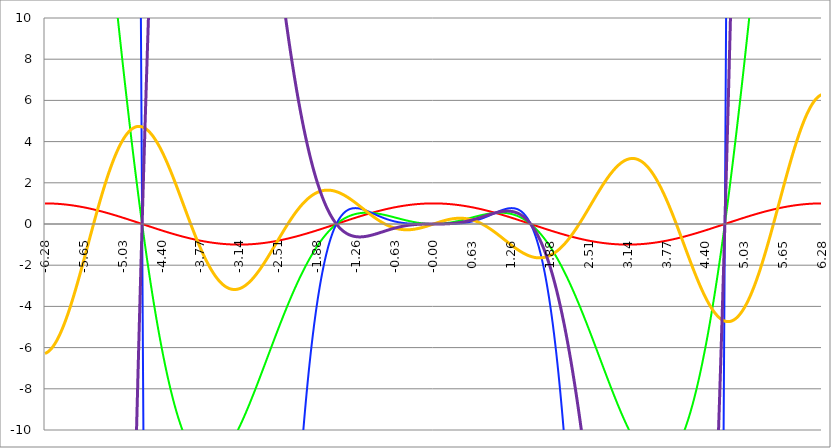
| Category | Series 1 | Series 0 | Series 2 | Series 3 | Series 4 |
|---|---|---|---|---|---|
| -6.283185307179586 | 1 | 39.478 | 1558.545 | -6.283 | -248.05 |
| -6.276902121872407 | 1 | 39.399 | 1552.29 | -6.276 | -247.302 |
| -6.270618936565228 | 1 | 39.318 | 1545.992 | -6.269 | -246.545 |
| -6.264335751258049 | 1 | 39.235 | 1539.653 | -6.26 | -245.781 |
| -6.25805256595087 | 1 | 39.151 | 1533.274 | -6.25 | -245.008 |
| -6.25176938064369 | 1 | 39.065 | 1526.854 | -6.239 | -244.227 |
| -6.245486195336511 | 0.999 | 38.978 | 1520.395 | -6.228 | -243.439 |
| -6.23920301002933 | 0.999 | 38.89 | 1513.897 | -6.215 | -242.643 |
| -6.232919824722153 | 0.999 | 38.8 | 1507.361 | -6.201 | -241.839 |
| -6.226636639414973 | 0.998 | 38.709 | 1500.788 | -6.187 | -241.027 |
| -6.220353454107794 | 0.998 | 38.616 | 1494.178 | -6.171 | -240.208 |
| -6.214070268800615 | 0.998 | 38.522 | 1487.533 | -6.155 | -239.381 |
| -6.207787083493435 | 0.997 | 38.427 | 1480.852 | -6.137 | -238.547 |
| -6.201503898186257 | 0.997 | 38.33 | 1474.136 | -6.119 | -237.706 |
| -6.195220712879077 | 0.996 | 38.232 | 1467.387 | -6.1 | -236.858 |
| -6.188937527571898 | 0.996 | 38.133 | 1460.605 | -6.079 | -236.002 |
| -6.182654342264719 | 0.995 | 38.032 | 1453.79 | -6.058 | -235.14 |
| -6.17637115695754 | 0.994 | 37.93 | 1446.943 | -6.036 | -234.271 |
| -6.170087971650361 | 0.994 | 37.827 | 1440.065 | -6.013 | -233.394 |
| -6.163804786343182 | 0.993 | 37.722 | 1433.156 | -5.989 | -232.512 |
| -6.157521601036002 | 0.992 | 37.616 | 1426.217 | -5.964 | -231.622 |
| -6.151238415728823 | 0.991 | 37.509 | 1419.249 | -5.938 | -230.726 |
| -6.144955230421644 | 0.99 | 37.4 | 1412.253 | -5.912 | -229.823 |
| -6.138672045114464 | 0.99 | 37.29 | 1405.228 | -5.884 | -228.914 |
| -6.132388859807286 | 0.989 | 37.179 | 1398.177 | -5.856 | -227.999 |
| -6.126105674500106 | 0.988 | 37.067 | 1391.098 | -5.826 | -227.077 |
| -6.119822489192927 | 0.987 | 36.954 | 1383.994 | -5.796 | -226.149 |
| -6.113539303885748 | 0.986 | 36.839 | 1376.864 | -5.765 | -225.216 |
| -6.107256118578569 | 0.985 | 36.723 | 1369.71 | -5.733 | -224.276 |
| -6.10097293327139 | 0.983 | 36.606 | 1362.532 | -5.7 | -223.33 |
| -6.09468974796421 | 0.982 | 36.487 | 1355.33 | -5.667 | -222.379 |
| -6.088406562657031 | 0.981 | 36.368 | 1348.105 | -5.632 | -221.422 |
| -6.082123377349852 | 0.98 | 36.247 | 1340.858 | -5.597 | -220.459 |
| -6.075840192042672 | 0.979 | 36.125 | 1333.589 | -5.561 | -219.491 |
| -6.069557006735494 | 0.977 | 36.002 | 1326.3 | -5.524 | -218.517 |
| -6.063273821428314 | 0.976 | 35.878 | 1318.99 | -5.486 | -217.538 |
| -6.056990636121135 | 0.975 | 35.753 | 1311.66 | -5.448 | -216.553 |
| -6.050707450813956 | 0.973 | 35.626 | 1304.312 | -5.408 | -215.564 |
| -6.044424265506777 | 0.972 | 35.499 | 1296.945 | -5.368 | -214.569 |
| -6.038141080199597 | 0.97 | 35.37 | 1289.56 | -5.327 | -213.569 |
| -6.031857894892418 | 0.969 | 35.24 | 1282.157 | -5.286 | -212.564 |
| -6.025574709585239 | 0.967 | 35.109 | 1274.738 | -5.243 | -211.555 |
| -6.01929152427806 | 0.965 | 34.978 | 1267.303 | -5.2 | -210.54 |
| -6.013008338970881 | 0.964 | 34.845 | 1259.853 | -5.156 | -209.521 |
| -6.006725153663701 | 0.962 | 34.711 | 1252.387 | -5.112 | -208.497 |
| -6.000441968356522 | 0.96 | 34.576 | 1244.907 | -5.066 | -207.469 |
| -5.994158783049343 | 0.959 | 34.44 | 1237.414 | -5.02 | -206.437 |
| -5.987875597742164 | 0.957 | 34.303 | 1229.907 | -4.974 | -205.4 |
| -5.981592412434984 | 0.955 | 34.165 | 1222.388 | -4.926 | -204.358 |
| -5.975309227127805 | 0.953 | 34.025 | 1214.857 | -4.878 | -203.313 |
| -5.969026041820626 | 0.951 | 33.885 | 1207.314 | -4.829 | -202.263 |
| -5.962742856513447 | 0.949 | 33.744 | 1199.76 | -4.78 | -201.209 |
| -5.956459671206268 | 0.947 | 33.602 | 1192.197 | -4.729 | -200.152 |
| -5.950176485899088 | 0.945 | 33.46 | 1184.623 | -4.679 | -199.09 |
| -5.94389330059191 | 0.943 | 33.316 | 1177.04 | -4.627 | -198.025 |
| -5.93761011528473 | 0.941 | 33.171 | 1169.449 | -4.575 | -196.956 |
| -5.931326929977551 | 0.939 | 33.025 | 1161.85 | -4.522 | -195.884 |
| -5.925043744670372 | 0.937 | 32.879 | 1154.243 | -4.469 | -194.807 |
| -5.918760559363193 | 0.934 | 32.731 | 1146.629 | -4.415 | -193.728 |
| -5.912477374056014 | 0.932 | 32.583 | 1139.009 | -4.361 | -192.645 |
| -5.906194188748834 | 0.93 | 32.434 | 1131.382 | -4.305 | -191.559 |
| -5.899911003441655 | 0.927 | 32.283 | 1123.751 | -4.25 | -190.469 |
| -5.893627818134476 | 0.925 | 32.132 | 1116.115 | -4.194 | -189.377 |
| -5.887344632827297 | 0.923 | 31.981 | 1108.474 | -4.137 | -188.281 |
| -5.881061447520117 | 0.92 | 31.828 | 1100.83 | -4.079 | -187.182 |
| -5.874778262212938 | 0.918 | 31.674 | 1093.182 | -4.022 | -186.081 |
| -5.868495076905759 | 0.915 | 31.52 | 1085.532 | -3.963 | -184.976 |
| -5.86221189159858 | 0.913 | 31.365 | 1077.879 | -3.904 | -183.869 |
| -5.855928706291401 | 0.91 | 31.209 | 1070.225 | -3.845 | -182.759 |
| -5.849645520984221 | 0.907 | 31.053 | 1062.57 | -3.785 | -181.647 |
| -5.843362335677042 | 0.905 | 30.895 | 1054.913 | -3.725 | -180.532 |
| -5.837079150369863 | 0.902 | 30.737 | 1047.257 | -3.664 | -179.415 |
| -5.830795965062684 | 0.899 | 30.578 | 1039.601 | -3.603 | -178.295 |
| -5.824512779755505 | 0.897 | 30.419 | 1031.946 | -3.541 | -177.173 |
| -5.818229594448325 | 0.894 | 30.258 | 1024.292 | -3.479 | -176.049 |
| -5.811946409141146 | 0.891 | 30.097 | 1016.64 | -3.416 | -174.923 |
| -5.805663223833967 | 0.888 | 29.935 | 1008.99 | -3.353 | -173.794 |
| -5.799380038526788 | 0.885 | 29.773 | 1001.343 | -3.29 | -172.664 |
| -5.793096853219609 | 0.882 | 29.61 | 993.7 | -3.226 | -171.532 |
| -5.78681366791243 | 0.879 | 29.446 | 986.06 | -3.162 | -170.398 |
| -5.780530482605251 | 0.876 | 29.281 | 978.424 | -3.097 | -169.262 |
| -5.774247297298071 | 0.873 | 29.116 | 970.792 | -3.032 | -168.124 |
| -5.767964111990892 | 0.87 | 28.951 | 963.166 | -2.967 | -166.985 |
| -5.761680926683713 | 0.867 | 28.784 | 955.545 | -2.902 | -165.845 |
| -5.755397741376534 | 0.864 | 28.617 | 947.931 | -2.836 | -164.703 |
| -5.749114556069355 | 0.861 | 28.45 | 940.323 | -2.77 | -163.56 |
| -5.742831370762175 | 0.858 | 28.281 | 932.721 | -2.703 | -162.415 |
| -5.736548185454996 | 0.854 | 28.113 | 925.127 | -2.636 | -161.269 |
| -5.730265000147816 | 0.851 | 27.943 | 917.541 | -2.569 | -160.122 |
| -5.723981814840638 | 0.848 | 27.773 | 909.963 | -2.502 | -158.974 |
| -5.717698629533459 | 0.844 | 27.603 | 902.394 | -2.434 | -157.825 |
| -5.711415444226279 | 0.841 | 27.432 | 894.834 | -2.367 | -156.675 |
| -5.7051322589191 | 0.838 | 27.26 | 887.283 | -2.299 | -155.524 |
| -5.698849073611921 | 0.834 | 27.088 | 879.742 | -2.23 | -154.372 |
| -5.692565888304742 | 0.831 | 26.916 | 872.212 | -2.162 | -153.219 |
| -5.686282702997562 | 0.827 | 26.743 | 864.692 | -2.093 | -152.066 |
| -5.679999517690383 | 0.824 | 26.569 | 857.184 | -2.024 | -150.913 |
| -5.673716332383204 | 0.82 | 26.395 | 849.687 | -1.955 | -149.758 |
| -5.667433147076025 | 0.816 | 26.221 | 842.202 | -1.886 | -148.604 |
| -5.661149961768846 | 0.813 | 26.046 | 834.73 | -1.817 | -147.449 |
| -5.654866776461667 | 0.809 | 25.87 | 827.27 | -1.747 | -146.293 |
| -5.648583591154487 | 0.805 | 25.695 | 819.823 | -1.678 | -145.138 |
| -5.642300405847308 | 0.802 | 25.518 | 812.39 | -1.608 | -143.982 |
| -5.63601722054013 | 0.798 | 25.342 | 804.971 | -1.538 | -142.826 |
| -5.62973403523295 | 0.794 | 25.165 | 797.566 | -1.468 | -141.67 |
| -5.623450849925771 | 0.79 | 24.987 | 790.176 | -1.398 | -140.514 |
| -5.617167664618591 | 0.786 | 24.809 | 782.801 | -1.328 | -139.359 |
| -5.610884479311412 | 0.782 | 24.631 | 775.442 | -1.258 | -138.203 |
| -5.604601294004233 | 0.778 | 24.453 | 768.098 | -1.188 | -137.048 |
| -5.598318108697054 | 0.775 | 24.274 | 760.77 | -1.118 | -135.893 |
| -5.592034923389875 | 0.771 | 24.095 | 753.459 | -1.048 | -134.738 |
| -5.585751738082695 | 0.766 | 23.915 | 746.165 | -0.978 | -133.584 |
| -5.579468552775516 | 0.762 | 23.735 | 738.888 | -0.907 | -132.43 |
| -5.573185367468337 | 0.758 | 23.555 | 731.628 | -0.837 | -131.276 |
| -5.566902182161157 | 0.754 | 23.375 | 724.387 | -0.767 | -130.124 |
| -5.560618996853979 | 0.75 | 23.194 | 717.163 | -0.697 | -128.972 |
| -5.5543358115468 | 0.746 | 23.013 | 709.959 | -0.627 | -127.821 |
| -5.54805262623962 | 0.742 | 22.831 | 702.773 | -0.557 | -126.67 |
| -5.54176944093244 | 0.738 | 22.65 | 695.606 | -0.487 | -125.521 |
| -5.535486255625262 | 0.733 | 22.468 | 688.459 | -0.417 | -124.372 |
| -5.529203070318083 | 0.729 | 22.286 | 681.332 | -0.347 | -123.224 |
| -5.522919885010904 | 0.725 | 22.104 | 674.225 | -0.277 | -122.078 |
| -5.516636699703724 | 0.72 | 21.921 | 667.139 | -0.208 | -120.932 |
| -5.510353514396545 | 0.716 | 21.739 | 660.074 | -0.138 | -119.788 |
| -5.504070329089366 | 0.712 | 21.556 | 653.029 | -0.069 | -118.645 |
| -5.497787143782186 | 0.707 | 21.373 | 646.006 | 0 | -117.503 |
| -5.491503958475008 | 0.703 | 21.19 | 639.005 | 0.069 | -116.362 |
| -5.485220773167828 | 0.698 | 21.006 | 632.026 | 0.138 | -115.223 |
| -5.47893758786065 | 0.694 | 20.823 | 625.069 | 0.207 | -114.086 |
| -5.47265440255347 | 0.689 | 20.639 | 618.135 | 0.275 | -112.95 |
| -5.466371217246291 | 0.685 | 20.455 | 611.223 | 0.343 | -111.815 |
| -5.460088031939112 | 0.68 | 20.271 | 604.335 | 0.411 | -110.682 |
| -5.453804846631932 | 0.675 | 20.087 | 597.47 | 0.479 | -109.551 |
| -5.447521661324753 | 0.671 | 19.903 | 590.629 | 0.547 | -108.422 |
| -5.441238476017574 | 0.666 | 19.719 | 583.812 | 0.614 | -107.294 |
| -5.434955290710395 | 0.661 | 19.534 | 577.019 | 0.681 | -106.168 |
| -5.428672105403215 | 0.657 | 19.35 | 570.251 | 0.748 | -105.044 |
| -5.422388920096036 | 0.652 | 19.165 | 563.507 | 0.815 | -103.922 |
| -5.416105734788857 | 0.647 | 18.981 | 556.789 | 0.881 | -102.802 |
| -5.409822549481678 | 0.642 | 18.796 | 550.095 | 0.947 | -101.685 |
| -5.403539364174499 | 0.637 | 18.612 | 543.428 | 1.013 | -100.569 |
| -5.39725617886732 | 0.633 | 18.427 | 536.786 | 1.078 | -99.455 |
| -5.39097299356014 | 0.628 | 18.242 | 530.17 | 1.143 | -98.344 |
| -5.384689808252961 | 0.623 | 18.058 | 523.58 | 1.208 | -97.235 |
| -5.378406622945782 | 0.618 | 17.873 | 517.016 | 1.272 | -96.128 |
| -5.372123437638603 | 0.613 | 17.688 | 510.48 | 1.336 | -95.024 |
| -5.365840252331424 | 0.608 | 17.504 | 503.97 | 1.4 | -93.922 |
| -5.359557067024244 | 0.603 | 17.319 | 497.487 | 1.463 | -92.823 |
| -5.353273881717065 | 0.598 | 17.134 | 491.032 | 1.526 | -91.726 |
| -5.346990696409886 | 0.593 | 16.95 | 484.605 | 1.588 | -90.631 |
| -5.340707511102707 | 0.588 | 16.765 | 478.205 | 1.65 | -89.54 |
| -5.334424325795528 | 0.583 | 16.581 | 471.833 | 1.712 | -88.451 |
| -5.328141140488348 | 0.578 | 16.397 | 465.489 | 1.773 | -87.364 |
| -5.32185795518117 | 0.572 | 16.213 | 459.174 | 1.834 | -86.281 |
| -5.31557476987399 | 0.567 | 16.028 | 452.887 | 1.895 | -85.2 |
| -5.30929158456681 | 0.562 | 15.844 | 446.629 | 1.954 | -84.122 |
| -5.303008399259631 | 0.557 | 15.66 | 440.4 | 2.014 | -83.047 |
| -5.296725213952453 | 0.552 | 15.477 | 434.2 | 2.073 | -81.975 |
| -5.290442028645273 | 0.546 | 15.293 | 428.03 | 2.132 | -80.906 |
| -5.284158843338094 | 0.541 | 15.109 | 421.889 | 2.19 | -79.84 |
| -5.277875658030915 | 0.536 | 14.926 | 415.778 | 2.247 | -78.777 |
| -5.271592472723735 | 0.531 | 14.743 | 409.696 | 2.304 | -77.718 |
| -5.265309287416557 | 0.525 | 14.56 | 403.645 | 2.361 | -76.661 |
| -5.259026102109377 | 0.52 | 14.377 | 397.624 | 2.417 | -75.608 |
| -5.252742916802198 | 0.514 | 14.194 | 391.633 | 2.472 | -74.558 |
| -5.246459731495019 | 0.509 | 14.012 | 385.672 | 2.528 | -73.511 |
| -5.24017654618784 | 0.504 | 13.829 | 379.743 | 2.582 | -72.468 |
| -5.23389336088066 | 0.498 | 13.647 | 373.844 | 2.636 | -71.427 |
| -5.227610175573481 | 0.493 | 13.465 | 367.976 | 2.689 | -70.391 |
| -5.221326990266302 | 0.487 | 13.284 | 362.139 | 2.742 | -69.358 |
| -5.215043804959122 | 0.482 | 13.102 | 356.334 | 2.794 | -68.328 |
| -5.208760619651944 | 0.476 | 12.921 | 350.56 | 2.846 | -67.302 |
| -5.202477434344764 | 0.471 | 12.74 | 344.817 | 2.897 | -66.279 |
| -5.196194249037585 | 0.465 | 12.559 | 339.106 | 2.948 | -65.26 |
| -5.189911063730406 | 0.46 | 12.379 | 333.427 | 2.998 | -64.245 |
| -5.183627878423227 | 0.454 | 12.199 | 327.78 | 3.047 | -63.234 |
| -5.177344693116048 | 0.448 | 12.019 | 322.164 | 3.096 | -62.226 |
| -5.171061507808868 | 0.443 | 11.839 | 316.581 | 3.144 | -61.222 |
| -5.164778322501689 | 0.437 | 11.66 | 311.031 | 3.191 | -60.221 |
| -5.15849513719451 | 0.431 | 11.481 | 305.512 | 3.238 | -59.225 |
| -5.152211951887331 | 0.426 | 11.302 | 300.026 | 3.284 | -58.233 |
| -5.145928766580152 | 0.42 | 11.124 | 294.573 | 3.33 | -57.244 |
| -5.139645581272972 | 0.414 | 10.946 | 289.152 | 3.375 | -56.259 |
| -5.133362395965793 | 0.409 | 10.768 | 283.765 | 3.419 | -55.279 |
| -5.127079210658614 | 0.403 | 10.591 | 278.41 | 3.462 | -54.302 |
| -5.120796025351435 | 0.397 | 10.414 | 273.088 | 3.505 | -53.329 |
| -5.114512840044256 | 0.391 | 10.238 | 267.799 | 3.548 | -52.361 |
| -5.108229654737076 | 0.386 | 10.061 | 262.543 | 3.589 | -51.396 |
| -5.101946469429897 | 0.38 | 9.886 | 257.321 | 3.63 | -50.436 |
| -5.095663284122718 | 0.374 | 9.71 | 252.132 | 3.67 | -49.48 |
| -5.08938009881554 | 0.368 | 9.535 | 246.976 | 3.71 | -48.528 |
| -5.08309691350836 | 0.362 | 9.36 | 241.853 | 3.749 | -47.58 |
| -5.07681372820118 | 0.356 | 9.186 | 236.765 | 3.787 | -46.636 |
| -5.070530542894002 | 0.351 | 9.012 | 231.71 | 3.824 | -45.697 |
| -5.064247357586822 | 0.345 | 8.839 | 226.688 | 3.861 | -44.762 |
| -5.057964172279643 | 0.339 | 8.666 | 221.701 | 3.897 | -43.832 |
| -5.051680986972464 | 0.333 | 8.493 | 216.747 | 3.933 | -42.906 |
| -5.045397801665285 | 0.327 | 8.321 | 211.827 | 3.967 | -41.984 |
| -5.039114616358106 | 0.321 | 8.15 | 206.941 | 4.001 | -41.067 |
| -5.032831431050926 | 0.315 | 7.978 | 202.088 | 4.034 | -40.154 |
| -5.026548245743747 | 0.309 | 7.808 | 197.27 | 4.067 | -39.246 |
| -5.020265060436568 | 0.303 | 7.637 | 192.486 | 4.098 | -38.342 |
| -5.013981875129389 | 0.297 | 7.468 | 187.736 | 4.129 | -37.443 |
| -5.00769868982221 | 0.291 | 7.298 | 183.02 | 4.159 | -36.548 |
| -5.00141550451503 | 0.285 | 7.13 | 178.339 | 4.189 | -35.658 |
| -4.995132319207851 | 0.279 | 6.961 | 173.691 | 4.218 | -34.772 |
| -4.98884913390067 | 0.273 | 6.793 | 169.078 | 4.245 | -33.891 |
| -4.982565948593493 | 0.267 | 6.626 | 164.499 | 4.273 | -33.015 |
| -4.976282763286313 | 0.261 | 6.459 | 159.955 | 4.299 | -32.143 |
| -4.969999577979134 | 0.255 | 6.293 | 155.444 | 4.325 | -31.277 |
| -4.963716392671955 | 0.249 | 6.127 | 150.968 | 4.35 | -30.414 |
| -4.957433207364776 | 0.243 | 5.962 | 146.527 | 4.374 | -29.557 |
| -4.951150022057597 | 0.236 | 5.798 | 142.119 | 4.397 | -28.704 |
| -4.944866836750418 | 0.23 | 5.633 | 137.747 | 4.42 | -27.856 |
| -4.938583651443238 | 0.224 | 5.47 | 133.408 | 4.442 | -27.013 |
| -4.932300466136059 | 0.218 | 5.307 | 129.104 | 4.463 | -26.175 |
| -4.92601728082888 | 0.212 | 5.144 | 124.834 | 4.483 | -25.342 |
| -4.9197340955217 | 0.206 | 4.983 | 120.599 | 4.503 | -24.513 |
| -4.913450910214521 | 0.2 | 4.821 | 116.398 | 4.522 | -23.69 |
| -4.907167724907342 | 0.194 | 4.661 | 112.232 | 4.54 | -22.871 |
| -4.900884539600163 | 0.187 | 4.501 | 108.1 | 4.557 | -22.057 |
| -4.894601354292984 | 0.181 | 4.341 | 104.002 | 4.573 | -21.248 |
| -4.888318168985805 | 0.175 | 4.182 | 99.939 | 4.589 | -20.444 |
| -4.882034983678625 | 0.169 | 4.024 | 95.91 | 4.604 | -19.645 |
| -4.875751798371446 | 0.163 | 3.866 | 91.915 | 4.618 | -18.851 |
| -4.869468613064267 | 0.156 | 3.709 | 87.955 | 4.631 | -18.062 |
| -4.863185427757088 | 0.15 | 3.553 | 84.029 | 4.644 | -17.279 |
| -4.856902242449909 | 0.144 | 3.397 | 80.137 | 4.655 | -16.5 |
| -4.85061905714273 | 0.138 | 3.242 | 76.279 | 4.666 | -15.726 |
| -4.84433587183555 | 0.132 | 3.087 | 72.456 | 4.677 | -14.957 |
| -4.838052686528371 | 0.125 | 2.934 | 68.667 | 4.686 | -14.193 |
| -4.831769501221192 | 0.119 | 2.78 | 64.912 | 4.695 | -13.434 |
| -4.825486315914013 | 0.113 | 2.628 | 61.191 | 4.703 | -12.681 |
| -4.819203130606833 | 0.107 | 2.476 | 57.505 | 4.71 | -11.932 |
| -4.812919945299654 | 0.1 | 2.325 | 53.852 | 4.716 | -11.189 |
| -4.806636759992475 | 0.094 | 2.174 | 50.233 | 4.721 | -10.451 |
| -4.800353574685296 | 0.088 | 2.024 | 46.649 | 4.726 | -9.718 |
| -4.794070389378117 | 0.082 | 1.875 | 43.098 | 4.73 | -8.99 |
| -4.787787204070938 | 0.075 | 1.727 | 39.581 | 4.733 | -8.267 |
| -4.781504018763758 | 0.069 | 1.579 | 36.098 | 4.736 | -7.55 |
| -4.77522083345658 | 0.063 | 1.432 | 32.649 | 4.738 | -6.837 |
| -4.7689376481494 | 0.057 | 1.285 | 29.233 | 4.738 | -6.13 |
| -4.762654462842221 | 0.05 | 1.14 | 25.851 | 4.739 | -5.428 |
| -4.756371277535042 | 0.044 | 0.995 | 22.503 | 4.738 | -4.731 |
| -4.750088092227862 | 0.038 | 0.85 | 19.188 | 4.737 | -4.04 |
| -4.743804906920683 | 0.031 | 0.707 | 15.907 | 4.734 | -3.353 |
| -4.737521721613504 | 0.025 | 0.564 | 12.659 | 4.732 | -2.672 |
| -4.731238536306324 | 0.019 | 0.422 | 9.444 | 4.728 | -1.996 |
| -4.724955350999146 | 0.013 | 0.281 | 6.263 | 4.723 | -1.326 |
| -4.718672165691966 | 0.006 | 0.14 | 3.115 | 4.718 | -0.66 |
| -4.712388980384787 | 0 | 0 | 0 | 4.712 | 0 |
| -4.706105795077608 | -0.006 | -0.139 | -3.082 | 4.706 | 0.655 |
| -4.699822609770429 | -0.013 | -0.278 | -6.131 | 4.698 | 1.304 |
| -4.69353942446325 | -0.019 | -0.415 | -9.147 | 4.69 | 1.949 |
| -4.68725623915607 | -0.025 | -0.552 | -12.13 | 4.681 | 2.588 |
| -4.680973053848891 | -0.031 | -0.688 | -15.081 | 4.672 | 3.222 |
| -4.674689868541712 | -0.038 | -0.824 | -17.999 | 4.661 | 3.85 |
| -4.668406683234533 | -0.044 | -0.958 | -20.884 | 4.65 | 4.473 |
| -4.662123497927354 | -0.05 | -1.092 | -23.737 | 4.639 | 5.091 |
| -4.655840312620174 | -0.057 | -1.225 | -26.557 | 4.626 | 5.704 |
| -4.649557127312995 | -0.063 | -1.357 | -29.345 | 4.613 | 6.311 |
| -4.643273942005816 | -0.069 | -1.489 | -32.101 | 4.599 | 6.914 |
| -4.636990756698637 | -0.075 | -1.62 | -34.825 | 4.584 | 7.51 |
| -4.630707571391458 | -0.082 | -1.75 | -37.517 | 4.569 | 8.102 |
| -4.624424386084279 | -0.088 | -1.879 | -40.177 | 4.553 | 8.688 |
| -4.618141200777099 | -0.094 | -2.007 | -42.805 | 4.536 | 9.269 |
| -4.61185801546992 | -0.1 | -2.135 | -45.402 | 4.519 | 9.845 |
| -4.605574830162741 | -0.107 | -2.261 | -47.966 | 4.501 | 10.415 |
| -4.599291644855561 | -0.113 | -2.387 | -50.5 | 4.482 | 10.98 |
| -4.593008459548383 | -0.119 | -2.512 | -53.002 | 4.463 | 11.54 |
| -4.586725274241203 | -0.125 | -2.637 | -55.472 | 4.443 | 12.094 |
| -4.580442088934024 | -0.132 | -2.76 | -57.912 | 4.422 | 12.643 |
| -4.574158903626845 | -0.138 | -2.883 | -60.32 | 4.4 | 13.187 |
| -4.567875718319666 | -0.144 | -3.005 | -62.698 | 4.378 | 13.726 |
| -4.561592533012487 | -0.15 | -3.126 | -65.044 | 4.356 | 14.259 |
| -4.555309347705307 | -0.156 | -3.246 | -67.36 | 4.332 | 14.787 |
| -4.549026162398128 | -0.163 | -3.366 | -69.646 | 4.308 | 15.31 |
| -4.542742977090949 | -0.169 | -3.484 | -71.9 | 4.284 | 15.828 |
| -4.53645979178377 | -0.175 | -3.602 | -74.125 | 4.259 | 16.34 |
| -4.530176606476591 | -0.181 | -3.719 | -76.319 | 4.233 | 16.847 |
| -4.523893421169412 | -0.187 | -3.835 | -78.483 | 4.206 | 17.349 |
| -4.517610235862232 | -0.194 | -3.95 | -80.617 | 4.179 | 17.845 |
| -4.511327050555053 | -0.2 | -4.065 | -82.721 | 4.151 | 18.336 |
| -4.505043865247874 | -0.206 | -4.178 | -84.796 | 4.123 | 18.822 |
| -4.498760679940694 | -0.212 | -4.291 | -86.84 | 4.094 | 19.303 |
| -4.492477494633515 | -0.218 | -4.403 | -88.856 | 4.065 | 19.779 |
| -4.486194309326336 | -0.224 | -4.514 | -90.842 | 4.035 | 20.249 |
| -4.479911124019157 | -0.23 | -4.624 | -92.798 | 4.004 | 20.714 |
| -4.473627938711977 | -0.236 | -4.733 | -94.726 | 3.973 | 21.174 |
| -4.467344753404799 | -0.243 | -4.842 | -96.625 | 3.941 | 21.629 |
| -4.46106156809762 | -0.249 | -4.949 | -98.494 | 3.909 | 22.079 |
| -4.45477838279044 | -0.255 | -5.056 | -100.335 | 3.876 | 22.523 |
| -4.44849519748326 | -0.261 | -5.162 | -102.148 | 3.843 | 22.962 |
| -4.442212012176082 | -0.267 | -5.267 | -103.932 | 3.809 | 23.396 |
| -4.435928826868903 | -0.273 | -5.371 | -105.688 | 3.775 | 23.825 |
| -4.429645641561723 | -0.279 | -5.474 | -107.415 | 3.74 | 24.249 |
| -4.423362456254544 | -0.285 | -5.577 | -109.115 | 3.705 | 24.668 |
| -4.417079270947365 | -0.291 | -5.678 | -110.787 | 3.669 | 25.081 |
| -4.410796085640185 | -0.297 | -5.779 | -112.431 | 3.632 | 25.49 |
| -4.404512900333007 | -0.303 | -5.879 | -114.047 | 3.596 | 25.893 |
| -4.398229715025827 | -0.309 | -5.978 | -115.636 | 3.558 | 26.292 |
| -4.391946529718648 | -0.315 | -6.076 | -117.198 | 3.52 | 26.685 |
| -4.38566334441147 | -0.321 | -6.173 | -118.733 | 3.482 | 27.073 |
| -4.37938015910429 | -0.327 | -6.269 | -120.24 | 3.443 | 27.456 |
| -4.373096973797111 | -0.333 | -6.365 | -121.721 | 3.404 | 27.834 |
| -4.366813788489932 | -0.339 | -6.459 | -123.175 | 3.365 | 28.207 |
| -4.360530603182752 | -0.345 | -6.553 | -124.602 | 3.325 | 28.575 |
| -4.354247417875573 | -0.351 | -6.646 | -126.004 | 3.284 | 28.938 |
| -4.347964232568394 | -0.356 | -6.738 | -127.378 | 3.243 | 29.296 |
| -4.341681047261215 | -0.362 | -6.829 | -128.727 | 3.202 | 29.649 |
| -4.335397861954035 | -0.368 | -6.919 | -130.05 | 3.16 | 29.997 |
| -4.329114676646856 | -0.374 | -7.008 | -131.347 | 3.118 | 30.34 |
| -4.322831491339677 | -0.38 | -7.097 | -132.619 | 3.076 | 30.679 |
| -4.316548306032498 | -0.386 | -7.184 | -133.864 | 3.033 | 31.012 |
| -4.310265120725319 | -0.391 | -7.271 | -135.085 | 2.99 | 31.34 |
| -4.30398193541814 | -0.397 | -7.357 | -136.281 | 2.946 | 31.664 |
| -4.29769875011096 | -0.403 | -7.442 | -137.451 | 2.902 | 31.982 |
| -4.291415564803781 | -0.409 | -7.526 | -138.597 | 2.858 | 32.296 |
| -4.285132379496602 | -0.414 | -7.609 | -139.718 | 2.814 | 32.605 |
| -4.278849194189422 | -0.42 | -7.691 | -140.814 | 2.769 | 32.909 |
| -4.272566008882244 | -0.426 | -7.773 | -141.886 | 2.723 | 33.209 |
| -4.266282823575064 | -0.431 | -7.853 | -142.934 | 2.678 | 33.503 |
| -4.259999638267885 | -0.437 | -7.933 | -143.958 | 2.632 | 33.793 |
| -4.253716452960706 | -0.443 | -8.011 | -144.958 | 2.586 | 34.078 |
| -4.247433267653527 | -0.448 | -8.089 | -145.934 | 2.54 | 34.358 |
| -4.241150082346347 | -0.454 | -8.166 | -146.886 | 2.493 | 34.634 |
| -4.234866897039168 | -0.46 | -8.242 | -147.816 | 2.446 | 34.904 |
| -4.228583711731989 | -0.465 | -8.317 | -148.722 | 2.399 | 35.171 |
| -4.22230052642481 | -0.471 | -8.392 | -149.604 | 2.351 | 35.432 |
| -4.216017341117631 | -0.476 | -8.465 | -150.464 | 2.304 | 35.689 |
| -4.209734155810452 | -0.482 | -8.538 | -151.302 | 2.256 | 35.941 |
| -4.203450970503273 | -0.487 | -8.609 | -152.116 | 2.208 | 36.188 |
| -4.197167785196093 | -0.493 | -8.68 | -152.909 | 2.159 | 36.431 |
| -4.190884599888914 | -0.498 | -8.75 | -153.679 | 2.111 | 36.67 |
| -4.184601414581734 | -0.504 | -8.819 | -154.427 | 2.062 | 36.904 |
| -4.178318229274556 | -0.509 | -8.887 | -155.153 | 2.013 | 37.133 |
| -4.172035043967377 | -0.514 | -8.954 | -155.857 | 1.964 | 37.358 |
| -4.165751858660197 | -0.52 | -9.021 | -156.54 | 1.914 | 37.578 |
| -4.159468673353018 | -0.525 | -9.086 | -157.201 | 1.865 | 37.794 |
| -4.153185488045839 | -0.531 | -9.151 | -157.841 | 1.815 | 38.005 |
| -4.14690230273866 | -0.536 | -9.215 | -158.46 | 1.766 | 38.212 |
| -4.140619117431481 | -0.541 | -9.277 | -159.058 | 1.716 | 38.414 |
| -4.134335932124301 | -0.546 | -9.339 | -159.635 | 1.666 | 38.612 |
| -4.128052746817122 | -0.552 | -9.4 | -160.192 | 1.616 | 38.806 |
| -4.121769561509943 | -0.557 | -9.461 | -160.729 | 1.565 | 38.995 |
| -4.115486376202764 | -0.562 | -9.52 | -161.245 | 1.515 | 39.18 |
| -4.109203190895584 | -0.567 | -9.579 | -161.741 | 1.465 | 39.361 |
| -4.102920005588405 | -0.572 | -9.636 | -162.217 | 1.414 | 39.537 |
| -4.096636820281226 | -0.578 | -9.693 | -162.673 | 1.363 | 39.709 |
| -4.090353634974047 | -0.583 | -9.749 | -163.11 | 1.313 | 39.877 |
| -4.084070449666868 | -0.588 | -9.804 | -163.528 | 1.262 | 40.04 |
| -4.077787264359689 | -0.593 | -9.858 | -163.926 | 1.211 | 40.2 |
| -4.071504079052509 | -0.598 | -9.912 | -164.305 | 1.16 | 40.355 |
| -4.06522089374533 | -0.603 | -9.964 | -164.666 | 1.11 | 40.506 |
| -4.058937708438151 | -0.608 | -10.016 | -165.007 | 1.059 | 40.653 |
| -4.052654523130972 | -0.613 | -10.066 | -165.33 | 1.008 | 40.796 |
| -4.046371337823793 | -0.618 | -10.116 | -165.635 | 0.957 | 40.934 |
| -4.040088152516613 | -0.623 | -10.165 | -165.922 | 0.906 | 41.069 |
| -4.033804967209434 | -0.628 | -10.214 | -166.19 | 0.855 | 41.199 |
| -4.027521781902255 | -0.633 | -10.261 | -166.441 | 0.804 | 41.326 |
| -4.021238596595076 | -0.637 | -10.307 | -166.674 | 0.754 | 41.448 |
| -4.014955411287897 | -0.642 | -10.353 | -166.889 | 0.703 | 41.567 |
| -4.008672225980717 | -0.647 | -10.398 | -167.088 | 0.652 | 41.682 |
| -4.002389040673538 | -0.652 | -10.442 | -167.268 | 0.601 | 41.792 |
| -3.996105855366359 | -0.657 | -10.485 | -167.432 | 0.551 | 41.899 |
| -3.989822670059179 | -0.661 | -10.527 | -167.579 | 0.5 | 42.002 |
| -3.983539484752 | -0.666 | -10.569 | -167.71 | 0.45 | 42.101 |
| -3.97725629944482 | -0.671 | -10.609 | -167.824 | 0.399 | 42.196 |
| -3.97097311413764 | -0.675 | -10.649 | -167.921 | 0.349 | 42.287 |
| -3.96468992883046 | -0.68 | -10.688 | -168.003 | 0.299 | 42.375 |
| -3.958406743523281 | -0.685 | -10.726 | -168.068 | 0.249 | 42.458 |
| -3.952123558216101 | -0.689 | -10.763 | -168.118 | 0.199 | 42.539 |
| -3.945840372908922 | -0.694 | -10.8 | -168.151 | 0.149 | 42.615 |
| -3.939557187601742 | -0.698 | -10.836 | -168.17 | 0.099 | 42.687 |
| -3.933274002294562 | -0.703 | -10.87 | -168.173 | 0.049 | 42.756 |
| -3.926990816987382 | -0.707 | -10.904 | -168.161 | 0 | 42.822 |
| -3.920707631680203 | -0.712 | -10.938 | -168.134 | -0.049 | 42.883 |
| -3.914424446373023 | -0.716 | -10.97 | -168.092 | -0.098 | 42.942 |
| -3.908141261065844 | -0.72 | -11.002 | -168.035 | -0.147 | 42.996 |
| -3.901858075758664 | -0.725 | -11.032 | -167.964 | -0.196 | 43.047 |
| -3.895574890451484 | -0.729 | -11.062 | -167.878 | -0.245 | 43.095 |
| -3.889291705144305 | -0.733 | -11.092 | -167.779 | -0.293 | 43.139 |
| -3.883008519837125 | -0.738 | -11.12 | -167.665 | -0.341 | 43.179 |
| -3.876725334529945 | -0.742 | -11.148 | -167.538 | -0.389 | 43.216 |
| -3.870442149222766 | -0.746 | -11.174 | -167.397 | -0.437 | 43.25 |
| -3.864158963915586 | -0.75 | -11.2 | -167.242 | -0.484 | 43.28 |
| -3.857875778608407 | -0.754 | -11.226 | -167.074 | -0.532 | 43.307 |
| -3.851592593301227 | -0.758 | -11.25 | -166.893 | -0.579 | 43.331 |
| -3.845309407994047 | -0.762 | -11.274 | -166.699 | -0.625 | 43.351 |
| -3.839026222686868 | -0.766 | -11.297 | -166.492 | -0.672 | 43.368 |
| -3.832743037379688 | -0.771 | -11.319 | -166.272 | -0.718 | 43.382 |
| -3.826459852072508 | -0.775 | -11.34 | -166.04 | -0.764 | 43.392 |
| -3.820176666765329 | -0.778 | -11.361 | -165.795 | -0.81 | 43.4 |
| -3.813893481458149 | -0.782 | -11.38 | -165.538 | -0.855 | 43.404 |
| -3.807610296150969 | -0.786 | -11.4 | -165.269 | -0.9 | 43.405 |
| -3.80132711084379 | -0.79 | -11.418 | -164.988 | -0.945 | 43.403 |
| -3.79504392553661 | -0.794 | -11.435 | -164.696 | -0.99 | 43.398 |
| -3.78876074022943 | -0.798 | -11.452 | -164.392 | -1.034 | 43.389 |
| -3.782477554922251 | -0.802 | -11.468 | -164.076 | -1.078 | 43.378 |
| -3.776194369615071 | -0.805 | -11.483 | -163.749 | -1.122 | 43.364 |
| -3.769911184307892 | -0.809 | -11.498 | -163.411 | -1.165 | 43.346 |
| -3.763627999000712 | -0.813 | -11.512 | -163.062 | -1.208 | 43.326 |
| -3.757344813693532 | -0.816 | -11.525 | -162.703 | -1.251 | 43.303 |
| -3.751061628386352 | -0.82 | -11.537 | -162.332 | -1.293 | 43.276 |
| -3.744778443079173 | -0.824 | -11.549 | -161.952 | -1.335 | 43.247 |
| -3.738495257771993 | -0.827 | -11.56 | -161.56 | -1.376 | 43.215 |
| -3.732212072464814 | -0.831 | -11.57 | -161.159 | -1.417 | 43.181 |
| -3.725928887157634 | -0.834 | -11.579 | -160.748 | -1.458 | 43.143 |
| -3.719645701850454 | -0.838 | -11.588 | -160.327 | -1.499 | 43.103 |
| -3.713362516543275 | -0.841 | -11.596 | -159.896 | -1.539 | 43.06 |
| -3.707079331236095 | -0.844 | -11.603 | -159.455 | -1.578 | 43.014 |
| -3.700796145928915 | -0.848 | -11.61 | -159.005 | -1.618 | 42.965 |
| -3.694512960621736 | -0.851 | -11.616 | -158.546 | -1.657 | 42.914 |
| -3.688229775314556 | -0.854 | -11.621 | -158.078 | -1.695 | 42.86 |
| -3.681946590007376 | -0.858 | -11.625 | -157.6 | -1.733 | 42.804 |
| -3.675663404700197 | -0.861 | -11.629 | -157.114 | -1.771 | 42.744 |
| -3.669380219393017 | -0.864 | -11.632 | -156.62 | -1.808 | 42.683 |
| -3.663097034085838 | -0.867 | -11.635 | -156.116 | -1.845 | 42.619 |
| -3.656813848778658 | -0.87 | -11.636 | -155.605 | -1.881 | 42.552 |
| -3.650530663471478 | -0.873 | -11.637 | -155.085 | -1.917 | 42.483 |
| -3.644247478164299 | -0.876 | -11.638 | -154.557 | -1.953 | 42.411 |
| -3.63796429285712 | -0.879 | -11.638 | -154.021 | -1.988 | 42.337 |
| -3.631681107549939 | -0.882 | -11.637 | -153.477 | -2.022 | 42.261 |
| -3.62539792224276 | -0.885 | -11.635 | -152.925 | -2.057 | 42.182 |
| -3.61911473693558 | -0.888 | -11.633 | -152.366 | -2.09 | 42.1 |
| -3.612831551628401 | -0.891 | -11.63 | -151.8 | -2.124 | 42.017 |
| -3.606548366321221 | -0.894 | -11.626 | -151.226 | -2.156 | 41.931 |
| -3.600265181014041 | -0.897 | -11.622 | -150.646 | -2.189 | 41.843 |
| -3.593981995706862 | -0.899 | -11.617 | -150.058 | -2.221 | 41.753 |
| -3.587698810399682 | -0.902 | -11.612 | -149.463 | -2.252 | 41.66 |
| -3.581415625092502 | -0.905 | -11.606 | -148.862 | -2.283 | 41.565 |
| -3.575132439785323 | -0.907 | -11.599 | -148.254 | -2.313 | 41.468 |
| -3.568849254478143 | -0.91 | -11.592 | -147.64 | -2.343 | 41.369 |
| -3.562566069170964 | -0.913 | -11.584 | -147.02 | -2.373 | 41.268 |
| -3.556282883863784 | -0.915 | -11.575 | -146.393 | -2.402 | 41.165 |
| -3.549999698556604 | -0.918 | -11.566 | -145.76 | -2.43 | 41.059 |
| -3.543716513249425 | -0.92 | -11.556 | -145.122 | -2.458 | 40.952 |
| -3.537433327942245 | -0.923 | -11.546 | -144.478 | -2.486 | 40.843 |
| -3.531150142635065 | -0.925 | -11.535 | -143.828 | -2.513 | 40.731 |
| -3.524866957327886 | -0.927 | -11.523 | -143.172 | -2.539 | 40.618 |
| -3.518583772020706 | -0.93 | -11.511 | -142.512 | -2.565 | 40.503 |
| -3.512300586713526 | -0.932 | -11.498 | -141.846 | -2.59 | 40.385 |
| -3.506017401406347 | -0.934 | -11.485 | -141.174 | -2.615 | 40.266 |
| -3.499734216099167 | -0.937 | -11.471 | -140.498 | -2.64 | 40.145 |
| -3.493451030791987 | -0.939 | -11.456 | -139.817 | -2.664 | 40.023 |
| -3.487167845484808 | -0.941 | -11.441 | -139.132 | -2.687 | 39.898 |
| -3.480884660177628 | -0.943 | -11.426 | -138.441 | -2.71 | 39.772 |
| -3.474601474870449 | -0.945 | -11.41 | -137.747 | -2.732 | 39.644 |
| -3.468318289563269 | -0.947 | -11.393 | -137.047 | -2.754 | 39.514 |
| -3.462035104256089 | -0.949 | -11.376 | -136.344 | -2.775 | 39.383 |
| -3.45575191894891 | -0.951 | -11.358 | -135.636 | -2.796 | 39.249 |
| -3.44946873364173 | -0.953 | -11.339 | -134.925 | -2.816 | 39.115 |
| -3.44318554833455 | -0.955 | -11.32 | -134.21 | -2.836 | 38.978 |
| -3.436902363027371 | -0.957 | -11.301 | -133.49 | -2.855 | 38.84 |
| -3.430619177720191 | -0.959 | -11.281 | -132.768 | -2.873 | 38.701 |
| -3.424335992413011 | -0.96 | -11.26 | -132.041 | -2.891 | 38.56 |
| -3.418052807105832 | -0.962 | -11.239 | -131.311 | -2.909 | 38.417 |
| -3.411769621798652 | -0.964 | -11.218 | -130.578 | -2.926 | 38.273 |
| -3.405486436491473 | -0.965 | -11.196 | -129.842 | -2.942 | 38.127 |
| -3.399203251184293 | -0.967 | -11.173 | -129.103 | -2.958 | 37.98 |
| -3.392920065877113 | -0.969 | -11.15 | -128.361 | -2.973 | 37.832 |
| -3.386636880569934 | -0.97 | -11.127 | -127.615 | -2.988 | 37.682 |
| -3.380353695262754 | -0.972 | -11.103 | -126.867 | -3.002 | 37.531 |
| -3.374070509955574 | -0.973 | -11.078 | -126.117 | -3.016 | 37.378 |
| -3.367787324648395 | -0.975 | -11.053 | -125.364 | -3.029 | 37.224 |
| -3.361504139341215 | -0.976 | -11.028 | -124.608 | -3.042 | 37.069 |
| -3.355220954034035 | -0.977 | -11.002 | -123.851 | -3.054 | 36.913 |
| -3.348937768726855 | -0.979 | -10.975 | -123.091 | -3.065 | 36.755 |
| -3.342654583419676 | -0.98 | -10.948 | -122.329 | -3.076 | 36.596 |
| -3.336371398112496 | -0.981 | -10.921 | -121.564 | -3.086 | 36.436 |
| -3.330088212805317 | -0.982 | -10.893 | -120.798 | -3.096 | 36.275 |
| -3.323805027498137 | -0.983 | -10.865 | -120.031 | -3.106 | 36.112 |
| -3.317521842190957 | -0.985 | -10.836 | -119.261 | -3.114 | 35.949 |
| -3.311238656883778 | -0.986 | -10.807 | -118.49 | -3.122 | 35.784 |
| -3.304955471576598 | -0.987 | -10.777 | -117.718 | -3.13 | 35.619 |
| -3.298672286269419 | -0.988 | -10.747 | -116.944 | -3.137 | 35.452 |
| -3.292389100962239 | -0.989 | -10.717 | -116.168 | -3.144 | 35.284 |
| -3.286105915655059 | -0.99 | -10.686 | -115.392 | -3.15 | 35.115 |
| -3.27982273034788 | -0.99 | -10.655 | -114.614 | -3.155 | 34.945 |
| -3.2735395450407 | -0.991 | -10.623 | -113.836 | -3.16 | 34.775 |
| -3.26725635973352 | -0.992 | -10.591 | -113.056 | -3.165 | 34.603 |
| -3.260973174426341 | -0.993 | -10.558 | -112.276 | -3.168 | 34.43 |
| -3.254689989119161 | -0.994 | -10.525 | -111.495 | -3.172 | 34.257 |
| -3.248406803811982 | -0.994 | -10.492 | -110.713 | -3.175 | 34.082 |
| -3.242123618504802 | -0.995 | -10.458 | -109.931 | -3.177 | 33.907 |
| -3.235840433197622 | -0.996 | -10.424 | -109.148 | -3.179 | 33.731 |
| -3.229557247890442 | -0.996 | -10.39 | -108.365 | -3.18 | 33.554 |
| -3.223274062583263 | -0.997 | -10.355 | -107.582 | -3.18 | 33.377 |
| -3.216990877276083 | -0.997 | -10.32 | -106.798 | -3.18 | 33.198 |
| -3.210707691968904 | -0.998 | -10.284 | -106.014 | -3.18 | 33.019 |
| -3.204424506661724 | -0.998 | -10.248 | -105.231 | -3.179 | 32.839 |
| -3.198141321354544 | -0.998 | -10.212 | -104.447 | -3.178 | 32.659 |
| -3.191858136047365 | -0.999 | -10.175 | -103.663 | -3.176 | 32.477 |
| -3.185574950740185 | -0.999 | -10.138 | -102.88 | -3.173 | 32.296 |
| -3.179291765433005 | -0.999 | -10.101 | -102.097 | -3.17 | 32.113 |
| -3.173008580125826 | -1 | -10.063 | -101.314 | -3.167 | 31.93 |
| -3.166725394818646 | -1 | -10.025 | -100.532 | -3.163 | 31.746 |
| -3.160442209511467 | -1 | -9.987 | -99.75 | -3.158 | 31.562 |
| -3.154159024204287 | -1 | -9.948 | -98.969 | -3.153 | 31.377 |
| -3.147875838897107 | -1 | -9.909 | -98.189 | -3.148 | 31.192 |
| -3.141592653589928 | -1 | -9.87 | -97.409 | -3.142 | 31.006 |
| -3.135309468282748 | -1 | -9.83 | -96.63 | -3.135 | 30.82 |
| -3.129026282975568 | -1 | -9.79 | -95.852 | -3.128 | 30.633 |
| -3.122743097668389 | -1 | -9.75 | -95.075 | -3.121 | 30.446 |
| -3.116459912361209 | -1 | -9.709 | -94.299 | -3.113 | 30.259 |
| -3.110176727054029 | -1 | -9.668 | -93.525 | -3.104 | 30.071 |
| -3.10389354174685 | -0.999 | -9.627 | -92.751 | -3.095 | 29.882 |
| -3.09761035643967 | -0.999 | -9.586 | -91.979 | -3.086 | 29.693 |
| -3.09132717113249 | -0.999 | -9.544 | -91.208 | -3.076 | 29.504 |
| -3.085043985825311 | -0.998 | -9.502 | -90.438 | -3.065 | 29.315 |
| -3.078760800518131 | -0.998 | -9.46 | -89.67 | -3.054 | 29.125 |
| -3.072477615210952 | -0.998 | -9.418 | -88.903 | -3.043 | 28.935 |
| -3.066194429903772 | -0.997 | -9.375 | -88.138 | -3.031 | 28.745 |
| -3.059911244596592 | -0.997 | -9.332 | -87.375 | -3.019 | 28.555 |
| -3.053628059289413 | -0.996 | -9.289 | -86.613 | -3.006 | 28.364 |
| -3.047344873982233 | -0.996 | -9.245 | -85.853 | -2.993 | 28.173 |
| -3.041061688675053 | -0.995 | -9.201 | -85.095 | -2.98 | 27.982 |
| -3.034778503367874 | -0.994 | -9.157 | -84.338 | -2.966 | 27.791 |
| -3.028495318060694 | -0.994 | -9.113 | -83.584 | -2.951 | 27.599 |
| -3.022212132753515 | -0.993 | -9.069 | -82.832 | -2.936 | 27.408 |
| -3.015928947446335 | -0.992 | -9.024 | -82.082 | -2.921 | 27.216 |
| -3.009645762139155 | -0.991 | -8.979 | -81.334 | -2.905 | 27.024 |
| -3.003362576831975 | -0.99 | -8.934 | -80.588 | -2.889 | 26.832 |
| -2.997079391524796 | -0.99 | -8.889 | -79.844 | -2.873 | 26.641 |
| -2.990796206217616 | -0.989 | -8.843 | -79.103 | -2.856 | 26.449 |
| -2.984513020910436 | -0.988 | -8.798 | -78.364 | -2.838 | 26.257 |
| -2.978229835603257 | -0.987 | -8.752 | -77.627 | -2.821 | 26.065 |
| -2.971946650296077 | -0.986 | -8.706 | -76.893 | -2.803 | 25.873 |
| -2.965663464988898 | -0.985 | -8.659 | -76.161 | -2.784 | 25.681 |
| -2.959380279681718 | -0.983 | -8.613 | -75.432 | -2.765 | 25.489 |
| -2.953097094374538 | -0.982 | -8.566 | -74.705 | -2.746 | 25.297 |
| -2.946813909067359 | -0.981 | -8.52 | -73.981 | -2.726 | 25.105 |
| -2.94053072376018 | -0.98 | -8.473 | -73.26 | -2.706 | 24.914 |
| -2.934247538453 | -0.979 | -8.425 | -72.541 | -2.686 | 24.722 |
| -2.92796435314582 | -0.977 | -8.378 | -71.825 | -2.665 | 24.531 |
| -2.92168116783864 | -0.976 | -8.331 | -71.112 | -2.644 | 24.339 |
| -2.915397982531461 | -0.975 | -8.283 | -70.402 | -2.622 | 24.148 |
| -2.909114797224281 | -0.973 | -8.235 | -69.695 | -2.6 | 23.957 |
| -2.902831611917101 | -0.972 | -8.187 | -68.99 | -2.578 | 23.767 |
| -2.896548426609922 | -0.97 | -8.139 | -68.289 | -2.556 | 23.576 |
| -2.890265241302742 | -0.969 | -8.091 | -67.591 | -2.533 | 23.386 |
| -2.883982055995562 | -0.967 | -8.043 | -66.896 | -2.51 | 23.196 |
| -2.877698870688383 | -0.965 | -7.994 | -66.203 | -2.486 | 23.006 |
| -2.871415685381203 | -0.964 | -7.946 | -65.514 | -2.462 | 22.816 |
| -2.865132500074023 | -0.962 | -7.897 | -64.829 | -2.438 | 22.627 |
| -2.858849314766844 | -0.96 | -7.848 | -64.146 | -2.414 | 22.438 |
| -2.852566129459664 | -0.959 | -7.8 | -63.467 | -2.389 | 22.249 |
| -2.846282944152485 | -0.957 | -7.751 | -62.79 | -2.364 | 22.061 |
| -2.839999758845305 | -0.955 | -7.702 | -62.118 | -2.339 | 21.872 |
| -2.833716573538125 | -0.953 | -7.652 | -61.448 | -2.313 | 21.685 |
| -2.827433388230946 | -0.951 | -7.603 | -60.782 | -2.287 | 21.497 |
| -2.821150202923766 | -0.949 | -7.554 | -60.119 | -2.261 | 21.31 |
| -2.814867017616586 | -0.947 | -7.504 | -59.46 | -2.235 | 21.124 |
| -2.808583832309407 | -0.945 | -7.455 | -58.804 | -2.208 | 20.937 |
| -2.802300647002227 | -0.943 | -7.405 | -58.152 | -2.181 | 20.752 |
| -2.796017461695047 | -0.941 | -7.356 | -57.503 | -2.154 | 20.566 |
| -2.789734276387867 | -0.939 | -7.306 | -56.858 | -2.127 | 20.381 |
| -2.783451091080688 | -0.937 | -7.256 | -56.217 | -2.099 | 20.197 |
| -2.777167905773509 | -0.934 | -7.206 | -55.579 | -2.072 | 20.013 |
| -2.770884720466329 | -0.932 | -7.156 | -54.944 | -2.044 | 19.829 |
| -2.764601535159149 | -0.93 | -7.106 | -54.314 | -2.015 | 19.646 |
| -2.75831834985197 | -0.927 | -7.056 | -53.687 | -1.987 | 19.464 |
| -2.75203516454479 | -0.925 | -7.006 | -53.063 | -1.958 | 19.281 |
| -2.74575197923761 | -0.923 | -6.956 | -52.444 | -1.929 | 19.1 |
| -2.739468793930431 | -0.92 | -6.906 | -51.828 | -1.9 | 18.919 |
| -2.733185608623251 | -0.918 | -6.856 | -51.216 | -1.871 | 18.738 |
| -2.726902423316071 | -0.915 | -6.806 | -50.607 | -1.842 | 18.559 |
| -2.720619238008892 | -0.913 | -6.756 | -50.003 | -1.812 | 18.379 |
| -2.714336052701712 | -0.91 | -6.705 | -49.402 | -1.782 | 18.2 |
| -2.708052867394532 | -0.907 | -6.655 | -48.805 | -1.752 | 18.022 |
| -2.701769682087352 | -0.905 | -6.605 | -48.212 | -1.722 | 17.845 |
| -2.695486496780173 | -0.902 | -6.555 | -47.623 | -1.692 | 17.668 |
| -2.689203311472993 | -0.899 | -6.504 | -47.038 | -1.662 | 17.491 |
| -2.682920126165814 | -0.897 | -6.454 | -46.457 | -1.631 | 17.316 |
| -2.676636940858634 | -0.894 | -6.404 | -45.879 | -1.6 | 17.141 |
| -2.670353755551454 | -0.891 | -6.354 | -45.306 | -1.57 | 16.966 |
| -2.664070570244275 | -0.888 | -6.303 | -44.737 | -1.539 | 16.793 |
| -2.657787384937095 | -0.885 | -6.253 | -44.171 | -1.508 | 16.619 |
| -2.651504199629916 | -0.882 | -6.203 | -43.61 | -1.477 | 16.447 |
| -2.645221014322736 | -0.879 | -6.153 | -43.052 | -1.445 | 16.275 |
| -2.638937829015556 | -0.876 | -6.103 | -42.498 | -1.414 | 16.104 |
| -2.632654643708377 | -0.873 | -6.052 | -41.949 | -1.383 | 15.934 |
| -2.626371458401197 | -0.87 | -6.002 | -41.403 | -1.351 | 15.764 |
| -2.620088273094018 | -0.867 | -5.952 | -40.862 | -1.32 | 15.596 |
| -2.613805087786838 | -0.864 | -5.902 | -40.324 | -1.288 | 15.427 |
| -2.607521902479658 | -0.861 | -5.852 | -39.791 | -1.256 | 15.26 |
| -2.601238717172478 | -0.858 | -5.802 | -39.262 | -1.224 | 15.093 |
| -2.594955531865299 | -0.854 | -5.753 | -38.736 | -1.193 | 14.928 |
| -2.588672346558119 | -0.851 | -5.703 | -38.215 | -1.161 | 14.762 |
| -2.58238916125094 | -0.848 | -5.653 | -37.698 | -1.129 | 14.598 |
| -2.57610597594376 | -0.844 | -5.603 | -37.185 | -1.097 | 14.435 |
| -2.56982279063658 | -0.841 | -5.554 | -36.676 | -1.065 | 14.272 |
| -2.563539605329401 | -0.838 | -5.504 | -36.171 | -1.033 | 14.11 |
| -2.557256420022221 | -0.834 | -5.455 | -35.67 | -1.001 | 13.949 |
| -2.550973234715042 | -0.831 | -5.405 | -35.173 | -0.969 | 13.788 |
| -2.544690049407862 | -0.827 | -5.356 | -34.681 | -0.937 | 13.629 |
| -2.538406864100682 | -0.824 | -5.306 | -34.192 | -0.905 | 13.47 |
| -2.532123678793503 | -0.82 | -5.257 | -33.708 | -0.873 | 13.312 |
| -2.525840493486323 | -0.816 | -5.208 | -33.227 | -0.841 | 13.155 |
| -2.519557308179143 | -0.813 | -5.159 | -32.751 | -0.809 | 12.999 |
| -2.513274122871964 | -0.809 | -5.11 | -32.279 | -0.777 | 12.843 |
| -2.506990937564784 | -0.805 | -5.061 | -31.811 | -0.745 | 12.689 |
| -2.500707752257604 | -0.802 | -5.013 | -31.347 | -0.713 | 12.535 |
| -2.494424566950425 | -0.798 | -4.964 | -30.887 | -0.681 | 12.382 |
| -2.488141381643245 | -0.794 | -4.915 | -30.431 | -0.649 | 12.23 |
| -2.481858196336065 | -0.79 | -4.867 | -29.979 | -0.617 | 12.079 |
| -2.475575011028886 | -0.786 | -4.819 | -29.532 | -0.585 | 11.929 |
| -2.469291825721706 | -0.782 | -4.771 | -29.088 | -0.554 | 11.78 |
| -2.463008640414527 | -0.778 | -4.722 | -28.648 | -0.522 | 11.631 |
| -2.456725455107347 | -0.775 | -4.675 | -28.213 | -0.491 | 11.484 |
| -2.450442269800167 | -0.771 | -4.627 | -27.782 | -0.459 | 11.337 |
| -2.444159084492988 | -0.766 | -4.579 | -27.354 | -0.428 | 11.192 |
| -2.437875899185808 | -0.762 | -4.531 | -26.931 | -0.396 | 11.047 |
| -2.431592713878628 | -0.758 | -4.484 | -26.512 | -0.365 | 10.903 |
| -2.425309528571449 | -0.754 | -4.437 | -26.097 | -0.334 | 10.76 |
| -2.419026343264269 | -0.75 | -4.389 | -25.685 | -0.303 | 10.618 |
| -2.412743157957089 | -0.746 | -4.342 | -25.278 | -0.272 | 10.477 |
| -2.40645997264991 | -0.742 | -4.295 | -24.875 | -0.242 | 10.337 |
| -2.40017678734273 | -0.738 | -4.249 | -24.476 | -0.211 | 10.198 |
| -2.393893602035551 | -0.733 | -4.202 | -24.081 | -0.18 | 10.059 |
| -2.387610416728371 | -0.729 | -4.156 | -23.69 | -0.15 | 9.922 |
| -2.381327231421191 | -0.725 | -4.109 | -23.303 | -0.12 | 9.786 |
| -2.375044046114012 | -0.72 | -4.063 | -22.92 | -0.09 | 9.65 |
| -2.368760860806832 | -0.716 | -4.017 | -22.54 | -0.06 | 9.516 |
| -2.362477675499652 | -0.712 | -3.971 | -22.165 | -0.03 | 9.382 |
| -2.356194490192473 | -0.707 | -3.926 | -21.794 | 0 | 9.25 |
| -2.349911304885293 | -0.703 | -3.88 | -21.426 | 0.03 | 9.118 |
| -2.343628119578113 | -0.698 | -3.835 | -21.063 | 0.059 | 8.987 |
| -2.337344934270934 | -0.694 | -3.79 | -20.703 | 0.088 | 8.857 |
| -2.331061748963754 | -0.689 | -3.745 | -20.347 | 0.117 | 8.729 |
| -2.324778563656574 | -0.685 | -3.7 | -19.995 | 0.146 | 8.601 |
| -2.318495378349395 | -0.68 | -3.655 | -19.647 | 0.175 | 8.474 |
| -2.312212193042215 | -0.675 | -3.611 | -19.303 | 0.203 | 8.348 |
| -2.305929007735036 | -0.671 | -3.566 | -18.963 | 0.231 | 8.224 |
| -2.299645822427856 | -0.666 | -3.522 | -18.626 | 0.26 | 8.1 |
| -2.293362637120676 | -0.661 | -3.478 | -18.294 | 0.287 | 7.977 |
| -2.287079451813496 | -0.657 | -3.434 | -17.965 | 0.315 | 7.855 |
| -2.280796266506317 | -0.652 | -3.391 | -17.639 | 0.343 | 7.734 |
| -2.274513081199137 | -0.647 | -3.347 | -17.318 | 0.37 | 7.614 |
| -2.268229895891957 | -0.642 | -3.304 | -17 | 0.397 | 7.495 |
| -2.261946710584778 | -0.637 | -3.261 | -16.686 | 0.424 | 7.377 |
| -2.255663525277598 | -0.633 | -3.219 | -16.376 | 0.45 | 7.26 |
| -2.249380339970419 | -0.628 | -3.176 | -16.069 | 0.477 | 7.144 |
| -2.24309715466324 | -0.623 | -3.134 | -15.766 | 0.503 | 7.029 |
| -2.23681396935606 | -0.618 | -3.091 | -15.467 | 0.529 | 6.915 |
| -2.23053078404888 | -0.613 | -3.049 | -15.171 | 0.555 | 6.802 |
| -2.2242475987417 | -0.608 | -3.008 | -14.879 | 0.58 | 6.69 |
| -2.217964413434521 | -0.603 | -2.966 | -14.591 | 0.605 | 6.579 |
| -2.211681228127341 | -0.598 | -2.925 | -14.306 | 0.63 | 6.468 |
| -2.205398042820161 | -0.593 | -2.884 | -14.025 | 0.655 | 6.359 |
| -2.199114857512981 | -0.588 | -2.843 | -13.747 | 0.68 | 6.251 |
| -2.192831672205802 | -0.583 | -2.802 | -13.473 | 0.704 | 6.144 |
| -2.186548486898622 | -0.578 | -2.761 | -13.202 | 0.728 | 6.038 |
| -2.180265301591443 | -0.572 | -2.721 | -12.935 | 0.751 | 5.933 |
| -2.173982116284263 | -0.567 | -2.681 | -12.671 | 0.775 | 5.829 |
| -2.167698930977084 | -0.562 | -2.641 | -12.411 | 0.798 | 5.725 |
| -2.161415745669904 | -0.557 | -2.602 | -12.154 | 0.821 | 5.623 |
| -2.155132560362724 | -0.552 | -2.562 | -11.9 | 0.843 | 5.522 |
| -2.148849375055545 | -0.546 | -2.523 | -11.65 | 0.866 | 5.422 |
| -2.142566189748365 | -0.541 | -2.484 | -11.403 | 0.888 | 5.322 |
| -2.136283004441185 | -0.536 | -2.445 | -11.16 | 0.91 | 5.224 |
| -2.129999819134006 | -0.531 | -2.407 | -10.92 | 0.931 | 5.127 |
| -2.123716633826826 | -0.525 | -2.369 | -10.683 | 0.952 | 5.03 |
| -2.117433448519646 | -0.52 | -2.331 | -10.449 | 0.973 | 4.935 |
| -2.111150263212467 | -0.514 | -2.293 | -10.219 | 0.994 | 4.841 |
| -2.104867077905287 | -0.509 | -2.255 | -9.992 | 1.014 | 4.747 |
| -2.098583892598107 | -0.504 | -2.218 | -9.768 | 1.034 | 4.655 |
| -2.092300707290928 | -0.498 | -2.181 | -9.547 | 1.054 | 4.563 |
| -2.086017521983748 | -0.493 | -2.144 | -9.33 | 1.073 | 4.473 |
| -2.079734336676569 | -0.487 | -2.108 | -9.116 | 1.092 | 4.383 |
| -2.073451151369389 | -0.482 | -2.071 | -8.904 | 1.111 | 4.294 |
| -2.06716796606221 | -0.476 | -2.035 | -8.696 | 1.129 | 4.207 |
| -2.06088478075503 | -0.471 | -1.999 | -8.491 | 1.148 | 4.12 |
| -2.05460159544785 | -0.465 | -1.964 | -8.289 | 1.166 | 4.034 |
| -2.04831841014067 | -0.46 | -1.928 | -8.09 | 1.183 | 3.95 |
| -2.042035224833491 | -0.454 | -1.893 | -7.894 | 1.2 | 3.866 |
| -2.035752039526311 | -0.448 | -1.858 | -7.701 | 1.217 | 3.783 |
| -2.029468854219131 | -0.443 | -1.824 | -7.511 | 1.234 | 3.701 |
| -2.023185668911951 | -0.437 | -1.789 | -7.324 | 1.25 | 3.62 |
| -2.016902483604772 | -0.431 | -1.755 | -7.14 | 1.266 | 3.54 |
| -2.010619298297592 | -0.426 | -1.721 | -6.958 | 1.282 | 3.461 |
| -2.004336112990412 | -0.42 | -1.688 | -6.78 | 1.297 | 3.383 |
| -1.998052927683233 | -0.414 | -1.654 | -6.604 | 1.312 | 3.305 |
| -1.991769742376054 | -0.409 | -1.621 | -6.431 | 1.327 | 3.229 |
| -1.985486557068874 | -0.403 | -1.588 | -6.261 | 1.341 | 3.154 |
| -1.979203371761694 | -0.397 | -1.556 | -6.094 | 1.355 | 3.079 |
| -1.972920186454515 | -0.391 | -1.523 | -5.93 | 1.369 | 3.006 |
| -1.966637001147335 | -0.386 | -1.491 | -5.768 | 1.382 | 2.933 |
| -1.960353815840155 | -0.38 | -1.459 | -5.609 | 1.395 | 2.861 |
| -1.954070630532976 | -0.374 | -1.428 | -5.452 | 1.408 | 2.79 |
| -1.947787445225796 | -0.368 | -1.397 | -5.299 | 1.42 | 2.72 |
| -1.941504259918616 | -0.362 | -1.366 | -5.147 | 1.432 | 2.651 |
| -1.935221074611437 | -0.356 | -1.335 | -4.999 | 1.444 | 2.583 |
| -1.928937889304257 | -0.351 | -1.304 | -4.853 | 1.455 | 2.516 |
| -1.922654703997078 | -0.345 | -1.274 | -4.709 | 1.466 | 2.449 |
| -1.916371518689898 | -0.339 | -1.244 | -4.569 | 1.477 | 2.384 |
| -1.910088333382718 | -0.333 | -1.214 | -4.43 | 1.487 | 2.319 |
| -1.903805148075539 | -0.327 | -1.185 | -4.294 | 1.497 | 2.256 |
| -1.897521962768359 | -0.321 | -1.156 | -4.161 | 1.507 | 2.193 |
| -1.891238777461179 | -0.315 | -1.127 | -4.03 | 1.516 | 2.131 |
| -1.884955592154 | -0.309 | -1.098 | -3.901 | 1.525 | 2.07 |
| -1.87867240684682 | -0.303 | -1.07 | -3.775 | 1.534 | 2.009 |
| -1.87238922153964 | -0.297 | -1.041 | -3.651 | 1.542 | 1.95 |
| -1.866106036232461 | -0.291 | -1.013 | -3.529 | 1.55 | 1.891 |
| -1.859822850925281 | -0.285 | -0.986 | -3.41 | 1.558 | 1.834 |
| -1.853539665618102 | -0.279 | -0.959 | -3.293 | 1.565 | 1.777 |
| -1.847256480310922 | -0.273 | -0.931 | -3.178 | 1.572 | 1.721 |
| -1.840973295003742 | -0.267 | -0.905 | -3.066 | 1.579 | 1.665 |
| -1.834690109696563 | -0.261 | -0.878 | -2.955 | 1.585 | 1.611 |
| -1.828406924389383 | -0.255 | -0.852 | -2.847 | 1.591 | 1.557 |
| -1.822123739082203 | -0.249 | -0.826 | -2.741 | 1.597 | 1.504 |
| -1.815840553775024 | -0.243 | -0.8 | -2.638 | 1.602 | 1.453 |
| -1.809557368467844 | -0.236 | -0.774 | -2.536 | 1.607 | 1.401 |
| -1.803274183160664 | -0.23 | -0.749 | -2.436 | 1.612 | 1.351 |
| -1.796990997853485 | -0.224 | -0.724 | -2.339 | 1.616 | 1.301 |
| -1.790707812546305 | -0.218 | -0.7 | -2.243 | 1.62 | 1.253 |
| -1.784424627239125 | -0.212 | -0.675 | -2.15 | 1.624 | 1.205 |
| -1.778141441931946 | -0.206 | -0.651 | -2.058 | 1.627 | 1.157 |
| -1.771858256624766 | -0.2 | -0.627 | -1.968 | 1.631 | 1.111 |
| -1.765575071317587 | -0.194 | -0.603 | -1.881 | 1.633 | 1.065 |
| -1.759291886010407 | -0.187 | -0.58 | -1.795 | 1.636 | 1.02 |
| -1.753008700703227 | -0.181 | -0.557 | -1.711 | 1.638 | 0.976 |
| -1.746725515396048 | -0.175 | -0.534 | -1.629 | 1.64 | 0.933 |
| -1.740442330088868 | -0.169 | -0.511 | -1.549 | 1.641 | 0.89 |
| -1.734159144781688 | -0.163 | -0.489 | -1.471 | 1.642 | 0.848 |
| -1.727875959474509 | -0.156 | -0.467 | -1.394 | 1.643 | 0.807 |
| -1.72159277416733 | -0.15 | -0.445 | -1.32 | 1.644 | 0.767 |
| -1.715309588860149 | -0.144 | -0.424 | -1.247 | 1.644 | 0.727 |
| -1.70902640355297 | -0.138 | -0.402 | -1.175 | 1.644 | 0.688 |
| -1.70274321824579 | -0.132 | -0.381 | -1.106 | 1.644 | 0.65 |
| -1.69646003293861 | -0.125 | -0.361 | -1.038 | 1.643 | 0.612 |
| -1.690176847631431 | -0.119 | -0.34 | -0.972 | 1.642 | 0.575 |
| -1.683893662324251 | -0.113 | -0.32 | -0.907 | 1.641 | 0.539 |
| -1.677610477017072 | -0.107 | -0.3 | -0.844 | 1.639 | 0.503 |
| -1.671327291709892 | -0.1 | -0.28 | -0.783 | 1.638 | 0.469 |
| -1.665044106402712 | -0.094 | -0.261 | -0.723 | 1.636 | 0.434 |
| -1.658760921095533 | -0.088 | -0.242 | -0.665 | 1.633 | 0.401 |
| -1.652477735788353 | -0.082 | -0.223 | -0.608 | 1.63 | 0.368 |
| -1.646194550481173 | -0.075 | -0.204 | -0.553 | 1.628 | 0.336 |
| -1.639911365173994 | -0.069 | -0.186 | -0.499 | 1.624 | 0.305 |
| -1.633628179866814 | -0.063 | -0.168 | -0.447 | 1.621 | 0.274 |
| -1.627344994559634 | -0.057 | -0.15 | -0.396 | 1.617 | 0.244 |
| -1.621061809252455 | -0.05 | -0.132 | -0.347 | 1.613 | 0.214 |
| -1.614778623945275 | -0.044 | -0.115 | -0.299 | 1.609 | 0.185 |
| -1.608495438638096 | -0.038 | -0.098 | -0.252 | 1.604 | 0.157 |
| -1.602212253330916 | -0.031 | -0.081 | -0.207 | 1.599 | 0.129 |
| -1.595929068023736 | -0.025 | -0.064 | -0.163 | 1.594 | 0.102 |
| -1.589645882716557 | -0.019 | -0.048 | -0.12 | 1.589 | 0.076 |
| -1.583362697409377 | -0.013 | -0.032 | -0.079 | 1.583 | 0.05 |
| -1.577079512102197 | -0.006 | -0.016 | -0.039 | 1.577 | 0.025 |
| -1.570796326795018 | 0 | 0 | 0 | 1.571 | 0 |
| -1.564513141487838 | 0.006 | 0.015 | 0.038 | 1.564 | -0.024 |
| -1.558229956180659 | 0.013 | 0.031 | 0.074 | 1.558 | -0.048 |
| -1.551946770873479 | 0.019 | 0.045 | 0.109 | 1.551 | -0.07 |
| -1.545663585566299 | 0.025 | 0.06 | 0.143 | 1.544 | -0.093 |
| -1.53938040025912 | 0.031 | 0.074 | 0.176 | 1.536 | -0.115 |
| -1.53309721495194 | 0.038 | 0.089 | 0.208 | 1.529 | -0.136 |
| -1.52681402964476 | 0.044 | 0.102 | 0.239 | 1.521 | -0.156 |
| -1.520530844337581 | 0.05 | 0.116 | 0.269 | 1.513 | -0.177 |
| -1.514247659030401 | 0.057 | 0.13 | 0.297 | 1.505 | -0.196 |
| -1.507964473723221 | 0.063 | 0.143 | 0.325 | 1.496 | -0.215 |
| -1.501681288416042 | 0.069 | 0.156 | 0.351 | 1.487 | -0.234 |
| -1.495398103108862 | 0.075 | 0.168 | 0.377 | 1.478 | -0.252 |
| -1.489114917801682 | 0.082 | 0.181 | 0.401 | 1.469 | -0.269 |
| -1.482831732494503 | 0.088 | 0.193 | 0.425 | 1.46 | -0.286 |
| -1.476548547187323 | 0.094 | 0.205 | 0.447 | 1.45 | -0.303 |
| -1.470265361880144 | 0.1 | 0.217 | 0.469 | 1.441 | -0.319 |
| -1.463982176572964 | 0.107 | 0.228 | 0.49 | 1.431 | -0.335 |
| -1.457698991265784 | 0.113 | 0.24 | 0.51 | 1.421 | -0.35 |
| -1.451415805958605 | 0.119 | 0.251 | 0.529 | 1.41 | -0.364 |
| -1.445132620651425 | 0.125 | 0.262 | 0.547 | 1.4 | -0.378 |
| -1.438849435344245 | 0.132 | 0.272 | 0.564 | 1.389 | -0.392 |
| -1.432566250037066 | 0.138 | 0.283 | 0.58 | 1.378 | -0.405 |
| -1.426283064729886 | 0.144 | 0.293 | 0.596 | 1.367 | -0.418 |
| -1.419999879422706 | 0.15 | 0.303 | 0.611 | 1.356 | -0.43 |
| -1.413716694115527 | 0.156 | 0.313 | 0.625 | 1.345 | -0.442 |
| -1.407433508808347 | 0.163 | 0.322 | 0.638 | 1.333 | -0.453 |
| -1.401150323501168 | 0.169 | 0.331 | 0.651 | 1.321 | -0.464 |
| -1.394867138193988 | 0.175 | 0.341 | 0.663 | 1.309 | -0.475 |
| -1.388583952886808 | 0.181 | 0.349 | 0.674 | 1.297 | -0.485 |
| -1.382300767579629 | 0.187 | 0.358 | 0.684 | 1.285 | -0.495 |
| -1.376017582272449 | 0.194 | 0.366 | 0.694 | 1.273 | -0.504 |
| -1.369734396965269 | 0.2 | 0.375 | 0.703 | 1.26 | -0.513 |
| -1.36345121165809 | 0.206 | 0.383 | 0.711 | 1.248 | -0.522 |
| -1.35716802635091 | 0.212 | 0.39 | 0.719 | 1.235 | -0.53 |
| -1.35088484104373 | 0.218 | 0.398 | 0.726 | 1.222 | -0.538 |
| -1.344601655736551 | 0.224 | 0.405 | 0.733 | 1.209 | -0.545 |
| -1.338318470429371 | 0.23 | 0.413 | 0.739 | 1.196 | -0.552 |
| -1.332035285122191 | 0.236 | 0.42 | 0.745 | 1.183 | -0.559 |
| -1.325752099815012 | 0.243 | 0.426 | 0.749 | 1.17 | -0.565 |
| -1.319468914507832 | 0.249 | 0.433 | 0.754 | 1.156 | -0.571 |
| -1.313185729200653 | 0.255 | 0.439 | 0.758 | 1.143 | -0.577 |
| -1.306902543893473 | 0.261 | 0.446 | 0.761 | 1.129 | -0.582 |
| -1.300619358586293 | 0.267 | 0.451 | 0.764 | 1.115 | -0.587 |
| -1.294336173279114 | 0.273 | 0.457 | 0.766 | 1.101 | -0.592 |
| -1.288052987971934 | 0.279 | 0.463 | 0.768 | 1.088 | -0.596 |
| -1.281769802664754 | 0.285 | 0.468 | 0.769 | 1.074 | -0.6 |
| -1.275486617357575 | 0.291 | 0.473 | 0.77 | 1.059 | -0.604 |
| -1.269203432050395 | 0.297 | 0.478 | 0.771 | 1.045 | -0.607 |
| -1.262920246743215 | 0.303 | 0.483 | 0.771 | 1.031 | -0.61 |
| -1.256637061436036 | 0.309 | 0.488 | 0.771 | 1.017 | -0.613 |
| -1.250353876128856 | 0.315 | 0.492 | 0.77 | 1.002 | -0.616 |
| -1.244070690821677 | 0.321 | 0.497 | 0.769 | 0.988 | -0.618 |
| -1.237787505514497 | 0.327 | 0.501 | 0.767 | 0.973 | -0.62 |
| -1.231504320207317 | 0.333 | 0.505 | 0.766 | 0.959 | -0.622 |
| -1.225221134900138 | 0.339 | 0.509 | 0.763 | 0.944 | -0.623 |
| -1.218937949592958 | 0.345 | 0.512 | 0.761 | 0.929 | -0.624 |
| -1.212654764285778 | 0.351 | 0.515 | 0.758 | 0.915 | -0.625 |
| -1.206371578978599 | 0.356 | 0.519 | 0.755 | 0.9 | -0.626 |
| -1.20008839367142 | 0.362 | 0.522 | 0.751 | 0.885 | -0.626 |
| -1.193805208364239 | 0.368 | 0.525 | 0.748 | 0.87 | -0.626 |
| -1.18752202305706 | 0.374 | 0.527 | 0.744 | 0.855 | -0.626 |
| -1.18123883774988 | 0.38 | 0.53 | 0.739 | 0.84 | -0.626 |
| -1.1749556524427 | 0.386 | 0.532 | 0.735 | 0.826 | -0.625 |
| -1.168672467135521 | 0.391 | 0.535 | 0.73 | 0.811 | -0.625 |
| -1.162389281828341 | 0.397 | 0.537 | 0.725 | 0.796 | -0.624 |
| -1.156106096521162 | 0.403 | 0.539 | 0.72 | 0.781 | -0.623 |
| -1.149822911213982 | 0.409 | 0.54 | 0.714 | 0.766 | -0.621 |
| -1.143539725906802 | 0.414 | 0.542 | 0.709 | 0.751 | -0.62 |
| -1.137256540599623 | 0.42 | 0.543 | 0.703 | 0.736 | -0.618 |
| -1.130973355292443 | 0.426 | 0.545 | 0.697 | 0.721 | -0.616 |
| -1.124690169985263 | 0.431 | 0.546 | 0.69 | 0.706 | -0.614 |
| -1.118406984678084 | 0.437 | 0.547 | 0.684 | 0.691 | -0.611 |
| -1.112123799370904 | 0.443 | 0.548 | 0.677 | 0.676 | -0.609 |
| -1.105840614063724 | 0.448 | 0.548 | 0.671 | 0.661 | -0.606 |
| -1.099557428756545 | 0.454 | 0.549 | 0.664 | 0.646 | -0.604 |
| -1.093274243449365 | 0.46 | 0.549 | 0.657 | 0.631 | -0.601 |
| -1.086991058142186 | 0.465 | 0.55 | 0.649 | 0.617 | -0.597 |
| -1.080707872835006 | 0.471 | 0.55 | 0.642 | 0.602 | -0.594 |
| -1.074424687527826 | 0.476 | 0.55 | 0.635 | 0.587 | -0.591 |
| -1.068141502220647 | 0.482 | 0.55 | 0.627 | 0.572 | -0.587 |
| -1.061858316913467 | 0.487 | 0.549 | 0.619 | 0.558 | -0.583 |
| -1.055575131606287 | 0.493 | 0.549 | 0.612 | 0.543 | -0.58 |
| -1.049291946299108 | 0.498 | 0.549 | 0.604 | 0.528 | -0.576 |
| -1.043008760991928 | 0.504 | 0.548 | 0.596 | 0.514 | -0.571 |
| -1.036725575684748 | 0.509 | 0.547 | 0.588 | 0.499 | -0.567 |
| -1.030442390377569 | 0.514 | 0.546 | 0.58 | 0.485 | -0.563 |
| -1.024159205070389 | 0.52 | 0.545 | 0.572 | 0.471 | -0.558 |
| -1.01787601976321 | 0.525 | 0.544 | 0.564 | 0.456 | -0.554 |
| -1.01159283445603 | 0.531 | 0.543 | 0.556 | 0.442 | -0.549 |
| -1.00530964914885 | 0.536 | 0.542 | 0.547 | 0.428 | -0.544 |
| -0.999026463841671 | 0.541 | 0.54 | 0.539 | 0.414 | -0.54 |
| -0.992743278534491 | 0.546 | 0.538 | 0.531 | 0.4 | -0.535 |
| -0.986460093227311 | 0.552 | 0.537 | 0.522 | 0.386 | -0.53 |
| -0.980176907920132 | 0.557 | 0.535 | 0.514 | 0.372 | -0.524 |
| -0.973893722612952 | 0.562 | 0.533 | 0.506 | 0.359 | -0.519 |
| -0.967610537305772 | 0.567 | 0.531 | 0.497 | 0.345 | -0.514 |
| -0.961327351998593 | 0.572 | 0.529 | 0.489 | 0.331 | -0.509 |
| -0.955044166691413 | 0.578 | 0.527 | 0.481 | 0.318 | -0.503 |
| -0.948760981384233 | 0.583 | 0.525 | 0.472 | 0.304 | -0.498 |
| -0.942477796077054 | 0.588 | 0.522 | 0.464 | 0.291 | -0.492 |
| -0.936194610769874 | 0.593 | 0.52 | 0.455 | 0.278 | -0.486 |
| -0.929911425462695 | 0.598 | 0.517 | 0.447 | 0.265 | -0.481 |
| -0.923628240155515 | 0.603 | 0.514 | 0.439 | 0.252 | -0.475 |
| -0.917345054848335 | 0.608 | 0.512 | 0.431 | 0.239 | -0.469 |
| -0.911061869541156 | 0.613 | 0.509 | 0.422 | 0.227 | -0.463 |
| -0.904778684233976 | 0.618 | 0.506 | 0.414 | 0.214 | -0.458 |
| -0.898495498926796 | 0.623 | 0.503 | 0.406 | 0.202 | -0.452 |
| -0.892212313619617 | 0.628 | 0.5 | 0.398 | 0.189 | -0.446 |
| -0.885929128312437 | 0.633 | 0.496 | 0.39 | 0.177 | -0.44 |
| -0.879645943005257 | 0.637 | 0.493 | 0.382 | 0.165 | -0.434 |
| -0.873362757698078 | 0.642 | 0.49 | 0.374 | 0.153 | -0.428 |
| -0.867079572390898 | 0.647 | 0.486 | 0.366 | 0.141 | -0.422 |
| -0.860796387083718 | 0.652 | 0.483 | 0.358 | 0.129 | -0.416 |
| -0.854513201776539 | 0.657 | 0.479 | 0.35 | 0.118 | -0.41 |
| -0.848230016469359 | 0.661 | 0.476 | 0.342 | 0.106 | -0.404 |
| -0.84194683116218 | 0.666 | 0.472 | 0.335 | 0.095 | -0.397 |
| -0.835663645855 | 0.671 | 0.468 | 0.327 | 0.084 | -0.391 |
| -0.82938046054782 | 0.675 | 0.465 | 0.32 | 0.073 | -0.385 |
| -0.823097275240641 | 0.68 | 0.461 | 0.312 | 0.062 | -0.379 |
| -0.816814089933461 | 0.685 | 0.457 | 0.305 | 0.051 | -0.373 |
| -0.810530904626281 | 0.689 | 0.453 | 0.297 | 0.041 | -0.367 |
| -0.804247719319102 | 0.694 | 0.449 | 0.29 | 0.03 | -0.361 |
| -0.797964534011922 | 0.698 | 0.445 | 0.283 | 0.02 | -0.355 |
| -0.791681348704742 | 0.703 | 0.44 | 0.276 | 0.01 | -0.349 |
| -0.785398163397563 | 0.707 | 0.436 | 0.269 | 0 | -0.343 |
| -0.779114978090383 | 0.712 | 0.432 | 0.262 | -0.01 | -0.337 |
| -0.772831792783204 | 0.716 | 0.428 | 0.255 | -0.019 | -0.33 |
| -0.766548607476024 | 0.72 | 0.423 | 0.249 | -0.029 | -0.324 |
| -0.760265422168844 | 0.725 | 0.419 | 0.242 | -0.038 | -0.318 |
| -0.753982236861665 | 0.729 | 0.414 | 0.236 | -0.047 | -0.312 |
| -0.747699051554485 | 0.733 | 0.41 | 0.229 | -0.056 | -0.307 |
| -0.741415866247305 | 0.738 | 0.405 | 0.223 | -0.065 | -0.301 |
| -0.735132680940126 | 0.742 | 0.401 | 0.217 | -0.074 | -0.295 |
| -0.728849495632946 | 0.746 | 0.396 | 0.211 | -0.082 | -0.289 |
| -0.722566310325766 | 0.75 | 0.392 | 0.204 | -0.091 | -0.283 |
| -0.716283125018587 | 0.754 | 0.387 | 0.199 | -0.099 | -0.277 |
| -0.709999939711407 | 0.758 | 0.382 | 0.193 | -0.107 | -0.271 |
| -0.703716754404227 | 0.762 | 0.378 | 0.187 | -0.114 | -0.266 |
| -0.697433569097048 | 0.766 | 0.373 | 0.181 | -0.122 | -0.26 |
| -0.691150383789868 | 0.771 | 0.368 | 0.176 | -0.13 | -0.254 |
| -0.684867198482689 | 0.775 | 0.363 | 0.17 | -0.137 | -0.249 |
| -0.678584013175509 | 0.778 | 0.358 | 0.165 | -0.144 | -0.243 |
| -0.672300827868329 | 0.782 | 0.354 | 0.16 | -0.151 | -0.238 |
| -0.66601764256115 | 0.786 | 0.349 | 0.155 | -0.158 | -0.232 |
| -0.65973445725397 | 0.79 | 0.344 | 0.15 | -0.164 | -0.227 |
| -0.65345127194679 | 0.794 | 0.339 | 0.145 | -0.17 | -0.222 |
| -0.647168086639611 | 0.798 | 0.334 | 0.14 | -0.177 | -0.216 |
| -0.640884901332431 | 0.802 | 0.329 | 0.135 | -0.183 | -0.211 |
| -0.634601716025251 | 0.805 | 0.324 | 0.131 | -0.189 | -0.206 |
| -0.628318530718072 | 0.809 | 0.319 | 0.126 | -0.194 | -0.201 |
| -0.622035345410892 | 0.813 | 0.314 | 0.122 | -0.2 | -0.196 |
| -0.615752160103712 | 0.816 | 0.31 | 0.117 | -0.205 | -0.191 |
| -0.609468974796533 | 0.82 | 0.305 | 0.113 | -0.21 | -0.186 |
| -0.603185789489353 | 0.824 | 0.3 | 0.109 | -0.215 | -0.181 |
| -0.596902604182174 | 0.827 | 0.295 | 0.105 | -0.22 | -0.176 |
| -0.590619418874994 | 0.831 | 0.29 | 0.101 | -0.224 | -0.171 |
| -0.584336233567814 | 0.834 | 0.285 | 0.097 | -0.229 | -0.166 |
| -0.578053048260635 | 0.838 | 0.28 | 0.094 | -0.233 | -0.162 |
| -0.571769862953455 | 0.841 | 0.275 | 0.09 | -0.237 | -0.157 |
| -0.565486677646275 | 0.844 | 0.27 | 0.086 | -0.241 | -0.153 |
| -0.559203492339096 | 0.848 | 0.265 | 0.083 | -0.244 | -0.148 |
| -0.552920307031916 | 0.851 | 0.26 | 0.08 | -0.248 | -0.144 |
| -0.546637121724737 | 0.854 | 0.255 | 0.076 | -0.251 | -0.14 |
| -0.540353936417557 | 0.858 | 0.25 | 0.073 | -0.254 | -0.135 |
| -0.534070751110377 | 0.861 | 0.246 | 0.07 | -0.257 | -0.131 |
| -0.527787565803198 | 0.864 | 0.241 | 0.067 | -0.26 | -0.127 |
| -0.521504380496018 | 0.867 | 0.236 | 0.064 | -0.263 | -0.123 |
| -0.515221195188838 | 0.87 | 0.231 | 0.061 | -0.265 | -0.119 |
| -0.508938009881659 | 0.873 | 0.226 | 0.059 | -0.267 | -0.115 |
| -0.502654824574479 | 0.876 | 0.221 | 0.056 | -0.269 | -0.111 |
| -0.496371639267299 | 0.879 | 0.217 | 0.053 | -0.271 | -0.108 |
| -0.49008845396012 | 0.882 | 0.212 | 0.051 | -0.273 | -0.104 |
| -0.48380526865294 | 0.885 | 0.207 | 0.048 | -0.274 | -0.1 |
| -0.477522083345761 | 0.888 | 0.203 | 0.046 | -0.276 | -0.097 |
| -0.471238898038581 | 0.891 | 0.198 | 0.044 | -0.277 | -0.093 |
| -0.464955712731402 | 0.894 | 0.193 | 0.042 | -0.278 | -0.09 |
| -0.458672527424222 | 0.897 | 0.189 | 0.04 | -0.279 | -0.087 |
| -0.452389342117042 | 0.899 | 0.184 | 0.038 | -0.28 | -0.083 |
| -0.446106156809863 | 0.902 | 0.18 | 0.036 | -0.28 | -0.08 |
| -0.439822971502683 | 0.905 | 0.175 | 0.034 | -0.28 | -0.077 |
| -0.433539786195504 | 0.907 | 0.171 | 0.032 | -0.281 | -0.074 |
| -0.427256600888324 | 0.91 | 0.166 | 0.03 | -0.281 | -0.071 |
| -0.420973415581144 | 0.913 | 0.162 | 0.029 | -0.28 | -0.068 |
| -0.414690230273965 | 0.915 | 0.157 | 0.027 | -0.28 | -0.065 |
| -0.408407044966785 | 0.918 | 0.153 | 0.026 | -0.28 | -0.063 |
| -0.402123859659606 | 0.92 | 0.149 | 0.024 | -0.279 | -0.06 |
| -0.395840674352426 | 0.923 | 0.145 | 0.023 | -0.278 | -0.057 |
| -0.389557489045247 | 0.925 | 0.14 | 0.021 | -0.277 | -0.055 |
| -0.383274303738067 | 0.927 | 0.136 | 0.02 | -0.276 | -0.052 |
| -0.376991118430887 | 0.93 | 0.132 | 0.019 | -0.275 | -0.05 |
| -0.370707933123708 | 0.932 | 0.128 | 0.018 | -0.273 | -0.047 |
| -0.364424747816528 | 0.934 | 0.124 | 0.016 | -0.272 | -0.045 |
| -0.358141562509349 | 0.937 | 0.12 | 0.015 | -0.27 | -0.043 |
| -0.351858377202169 | 0.939 | 0.116 | 0.014 | -0.268 | -0.041 |
| -0.345575191894989 | 0.941 | 0.112 | 0.013 | -0.266 | -0.039 |
| -0.33929200658781 | 0.943 | 0.109 | 0.012 | -0.264 | -0.037 |
| -0.33300882128063 | 0.945 | 0.105 | 0.012 | -0.262 | -0.035 |
| -0.326725635973451 | 0.947 | 0.101 | 0.011 | -0.259 | -0.033 |
| -0.320442450666271 | 0.949 | 0.097 | 0.01 | -0.257 | -0.031 |
| -0.314159265359092 | 0.951 | 0.094 | 0.009 | -0.254 | -0.029 |
| -0.307876080051912 | 0.953 | 0.09 | 0.009 | -0.251 | -0.028 |
| -0.301592894744732 | 0.955 | 0.087 | 0.008 | -0.248 | -0.026 |
| -0.295309709437553 | 0.957 | 0.083 | 0.007 | -0.245 | -0.025 |
| -0.289026524130373 | 0.959 | 0.08 | 0.007 | -0.242 | -0.023 |
| -0.282743338823194 | 0.96 | 0.077 | 0.006 | -0.239 | -0.022 |
| -0.276460153516014 | 0.962 | 0.074 | 0.006 | -0.235 | -0.02 |
| -0.270176968208834 | 0.964 | 0.07 | 0.005 | -0.232 | -0.019 |
| -0.263893782901655 | 0.965 | 0.067 | 0.005 | -0.228 | -0.018 |
| -0.257610597594475 | 0.967 | 0.064 | 0.004 | -0.224 | -0.017 |
| -0.251327412287296 | 0.969 | 0.061 | 0.004 | -0.22 | -0.015 |
| -0.245044226980116 | 0.97 | 0.058 | 0.003 | -0.216 | -0.014 |
| -0.238761041672937 | 0.972 | 0.055 | 0.003 | -0.212 | -0.013 |
| -0.232477856365757 | 0.973 | 0.053 | 0.003 | -0.208 | -0.012 |
| -0.226194671058577 | 0.975 | 0.05 | 0.003 | -0.203 | -0.011 |
| -0.219911485751398 | 0.976 | 0.047 | 0.002 | -0.199 | -0.01 |
| -0.213628300444218 | 0.977 | 0.045 | 0.002 | -0.194 | -0.01 |
| -0.207345115137039 | 0.979 | 0.042 | 0.002 | -0.19 | -0.009 |
| -0.201061929829859 | 0.98 | 0.04 | 0.002 | -0.185 | -0.008 |
| -0.194778744522679 | 0.981 | 0.037 | 0.001 | -0.18 | -0.007 |
| -0.1884955592155 | 0.982 | 0.035 | 0.001 | -0.175 | -0.007 |
| -0.18221237390832 | 0.983 | 0.033 | 0.001 | -0.17 | -0.006 |
| -0.175929188601141 | 0.985 | 0.03 | 0.001 | -0.165 | -0.005 |
| -0.169646003293961 | 0.986 | 0.028 | 0.001 | -0.16 | -0.005 |
| -0.163362817986782 | 0.987 | 0.026 | 0.001 | -0.155 | -0.004 |
| -0.157079632679602 | 0.988 | 0.024 | 0.001 | -0.149 | -0.004 |
| -0.150796447372422 | 0.989 | 0.022 | 0.001 | -0.144 | -0.003 |
| -0.144513262065243 | 0.99 | 0.021 | 0 | -0.139 | -0.003 |
| -0.138230076758063 | 0.99 | 0.019 | 0 | -0.133 | -0.003 |
| -0.131946891450884 | 0.991 | 0.017 | 0 | -0.127 | -0.002 |
| -0.125663706143704 | 0.992 | 0.016 | 0 | -0.122 | -0.002 |
| -0.119380520836524 | 0.993 | 0.014 | 0 | -0.116 | -0.002 |
| -0.113097335529345 | 0.994 | 0.013 | 0 | -0.11 | -0.001 |
| -0.106814150222165 | 0.994 | 0.011 | 0 | -0.104 | -0.001 |
| -0.100530964914986 | 0.995 | 0.01 | 0 | -0.099 | -0.001 |
| -0.0942477796078061 | 0.996 | 0.009 | 0 | -0.093 | -0.001 |
| -0.0879645943006265 | 0.996 | 0.008 | 0 | -0.087 | -0.001 |
| -0.0816814089934469 | 0.997 | 0.007 | 0 | -0.081 | -0.001 |
| -0.0753982236862674 | 0.997 | 0.006 | 0 | -0.075 | 0 |
| -0.0691150383790878 | 0.998 | 0.005 | 0 | -0.068 | 0 |
| -0.0628318530719082 | 0.998 | 0.004 | 0 | -0.062 | 0 |
| -0.0565486677647286 | 0.998 | 0.003 | 0 | -0.056 | 0 |
| -0.050265482457549 | 0.999 | 0.003 | 0 | -0.05 | 0 |
| -0.0439822971503694 | 0.999 | 0.002 | 0 | -0.044 | 0 |
| -0.0376991118431899 | 0.999 | 0.001 | 0 | -0.038 | 0 |
| -0.0314159265360103 | 1 | 0.001 | 0 | -0.031 | 0 |
| -0.0251327412288307 | 1 | 0.001 | 0 | -0.025 | 0 |
| -0.0188495559216511 | 1 | 0 | 0 | -0.019 | 0 |
| -0.0125663706144715 | 1 | 0 | 0 | -0.013 | 0 |
| -0.00628318530729192 | 1 | 0 | 0 | -0.006 | 0 |
| -1.12338957580782e-13 | 1 | 0 | 0 | 0 | 0 |
| 0.00628318530706725 | 1 | 0 | 0 | 0.006 | 0 |
| 0.0125663706142468 | 1 | 0 | 0 | 0.013 | 0 |
| 0.0188495559214264 | 1 | 0 | 0 | 0.019 | 0 |
| 0.025132741228606 | 1 | 0.001 | 0 | 0.025 | 0 |
| 0.0314159265357856 | 1 | 0.001 | 0 | 0.031 | 0 |
| 0.0376991118429652 | 0.999 | 0.001 | 0 | 0.038 | 0 |
| 0.0439822971501448 | 0.999 | 0.002 | 0 | 0.044 | 0 |
| 0.0502654824573243 | 0.999 | 0.003 | 0 | 0.05 | 0 |
| 0.0565486677645039 | 0.998 | 0.003 | 0 | 0.056 | 0 |
| 0.0628318530716835 | 0.998 | 0.004 | 0 | 0.062 | 0 |
| 0.0691150383788631 | 0.998 | 0.005 | 0 | 0.068 | 0 |
| 0.0753982236860427 | 0.997 | 0.006 | 0 | 0.075 | 0 |
| 0.0816814089932222 | 0.997 | 0.007 | 0 | 0.081 | 0.001 |
| 0.0879645943004018 | 0.996 | 0.008 | 0 | 0.087 | 0.001 |
| 0.0942477796075814 | 0.996 | 0.009 | 0 | 0.093 | 0.001 |
| 0.100530964914761 | 0.995 | 0.01 | 0 | 0.099 | 0.001 |
| 0.106814150221941 | 0.994 | 0.011 | 0 | 0.104 | 0.001 |
| 0.11309733552912 | 0.994 | 0.013 | 0 | 0.11 | 0.001 |
| 0.1193805208363 | 0.993 | 0.014 | 0 | 0.116 | 0.002 |
| 0.125663706143479 | 0.992 | 0.016 | 0 | 0.122 | 0.002 |
| 0.131946891450659 | 0.991 | 0.017 | 0 | 0.127 | 0.002 |
| 0.138230076757839 | 0.99 | 0.019 | 0 | 0.133 | 0.003 |
| 0.144513262065018 | 0.99 | 0.021 | 0 | 0.139 | 0.003 |
| 0.150796447372198 | 0.989 | 0.022 | 0.001 | 0.144 | 0.003 |
| 0.157079632679377 | 0.988 | 0.024 | 0.001 | 0.149 | 0.004 |
| 0.163362817986557 | 0.987 | 0.026 | 0.001 | 0.155 | 0.004 |
| 0.169646003293736 | 0.986 | 0.028 | 0.001 | 0.16 | 0.005 |
| 0.175929188600916 | 0.985 | 0.03 | 0.001 | 0.165 | 0.005 |
| 0.182212373908096 | 0.983 | 0.033 | 0.001 | 0.17 | 0.006 |
| 0.188495559215275 | 0.982 | 0.035 | 0.001 | 0.175 | 0.007 |
| 0.194778744522455 | 0.981 | 0.037 | 0.001 | 0.18 | 0.007 |
| 0.201061929829634 | 0.98 | 0.04 | 0.002 | 0.185 | 0.008 |
| 0.207345115136814 | 0.979 | 0.042 | 0.002 | 0.19 | 0.009 |
| 0.213628300443994 | 0.977 | 0.045 | 0.002 | 0.194 | 0.01 |
| 0.219911485751173 | 0.976 | 0.047 | 0.002 | 0.199 | 0.01 |
| 0.226194671058353 | 0.975 | 0.05 | 0.003 | 0.203 | 0.011 |
| 0.232477856365532 | 0.973 | 0.053 | 0.003 | 0.208 | 0.012 |
| 0.238761041672712 | 0.972 | 0.055 | 0.003 | 0.212 | 0.013 |
| 0.245044226979891 | 0.97 | 0.058 | 0.003 | 0.216 | 0.014 |
| 0.251327412287071 | 0.969 | 0.061 | 0.004 | 0.22 | 0.015 |
| 0.257610597594251 | 0.967 | 0.064 | 0.004 | 0.224 | 0.017 |
| 0.26389378290143 | 0.965 | 0.067 | 0.005 | 0.228 | 0.018 |
| 0.27017696820861 | 0.964 | 0.07 | 0.005 | 0.232 | 0.019 |
| 0.276460153515789 | 0.962 | 0.074 | 0.006 | 0.235 | 0.02 |
| 0.282743338822969 | 0.96 | 0.077 | 0.006 | 0.239 | 0.022 |
| 0.289026524130149 | 0.959 | 0.08 | 0.007 | 0.242 | 0.023 |
| 0.295309709437328 | 0.957 | 0.083 | 0.007 | 0.245 | 0.025 |
| 0.301592894744508 | 0.955 | 0.087 | 0.008 | 0.248 | 0.026 |
| 0.307876080051687 | 0.953 | 0.09 | 0.009 | 0.251 | 0.028 |
| 0.314159265358867 | 0.951 | 0.094 | 0.009 | 0.254 | 0.029 |
| 0.320442450666046 | 0.949 | 0.097 | 0.01 | 0.257 | 0.031 |
| 0.326725635973226 | 0.947 | 0.101 | 0.011 | 0.259 | 0.033 |
| 0.333008821280406 | 0.945 | 0.105 | 0.012 | 0.262 | 0.035 |
| 0.339292006587585 | 0.943 | 0.109 | 0.012 | 0.264 | 0.037 |
| 0.345575191894765 | 0.941 | 0.112 | 0.013 | 0.266 | 0.039 |
| 0.351858377201944 | 0.939 | 0.116 | 0.014 | 0.268 | 0.041 |
| 0.358141562509124 | 0.937 | 0.12 | 0.015 | 0.27 | 0.043 |
| 0.364424747816304 | 0.934 | 0.124 | 0.016 | 0.272 | 0.045 |
| 0.370707933123483 | 0.932 | 0.128 | 0.018 | 0.273 | 0.047 |
| 0.376991118430663 | 0.93 | 0.132 | 0.019 | 0.275 | 0.05 |
| 0.383274303737842 | 0.927 | 0.136 | 0.02 | 0.276 | 0.052 |
| 0.389557489045022 | 0.925 | 0.14 | 0.021 | 0.277 | 0.055 |
| 0.395840674352201 | 0.923 | 0.145 | 0.023 | 0.278 | 0.057 |
| 0.402123859659381 | 0.92 | 0.149 | 0.024 | 0.279 | 0.06 |
| 0.408407044966561 | 0.918 | 0.153 | 0.026 | 0.28 | 0.063 |
| 0.41469023027374 | 0.915 | 0.157 | 0.027 | 0.28 | 0.065 |
| 0.42097341558092 | 0.913 | 0.162 | 0.029 | 0.28 | 0.068 |
| 0.427256600888099 | 0.91 | 0.166 | 0.03 | 0.281 | 0.071 |
| 0.433539786195279 | 0.907 | 0.171 | 0.032 | 0.281 | 0.074 |
| 0.439822971502459 | 0.905 | 0.175 | 0.034 | 0.28 | 0.077 |
| 0.446106156809638 | 0.902 | 0.18 | 0.036 | 0.28 | 0.08 |
| 0.452389342116818 | 0.899 | 0.184 | 0.038 | 0.28 | 0.083 |
| 0.458672527423997 | 0.897 | 0.189 | 0.04 | 0.279 | 0.087 |
| 0.464955712731177 | 0.894 | 0.193 | 0.042 | 0.278 | 0.09 |
| 0.471238898038356 | 0.891 | 0.198 | 0.044 | 0.277 | 0.093 |
| 0.477522083345536 | 0.888 | 0.203 | 0.046 | 0.276 | 0.097 |
| 0.483805268652716 | 0.885 | 0.207 | 0.048 | 0.274 | 0.1 |
| 0.490088453959895 | 0.882 | 0.212 | 0.051 | 0.273 | 0.104 |
| 0.496371639267075 | 0.879 | 0.217 | 0.053 | 0.271 | 0.108 |
| 0.502654824574254 | 0.876 | 0.221 | 0.056 | 0.269 | 0.111 |
| 0.508938009881434 | 0.873 | 0.226 | 0.059 | 0.267 | 0.115 |
| 0.515221195188614 | 0.87 | 0.231 | 0.061 | 0.265 | 0.119 |
| 0.521504380495793 | 0.867 | 0.236 | 0.064 | 0.263 | 0.123 |
| 0.527787565802973 | 0.864 | 0.241 | 0.067 | 0.26 | 0.127 |
| 0.534070751110153 | 0.861 | 0.246 | 0.07 | 0.257 | 0.131 |
| 0.540353936417332 | 0.858 | 0.25 | 0.073 | 0.254 | 0.135 |
| 0.546637121724512 | 0.854 | 0.255 | 0.076 | 0.251 | 0.14 |
| 0.552920307031692 | 0.851 | 0.26 | 0.08 | 0.248 | 0.144 |
| 0.559203492338871 | 0.848 | 0.265 | 0.083 | 0.244 | 0.148 |
| 0.565486677646051 | 0.844 | 0.27 | 0.086 | 0.241 | 0.153 |
| 0.571769862953231 | 0.841 | 0.275 | 0.09 | 0.237 | 0.157 |
| 0.57805304826041 | 0.838 | 0.28 | 0.094 | 0.233 | 0.162 |
| 0.58433623356759 | 0.834 | 0.285 | 0.097 | 0.229 | 0.166 |
| 0.590619418874769 | 0.831 | 0.29 | 0.101 | 0.224 | 0.171 |
| 0.596902604181949 | 0.827 | 0.295 | 0.105 | 0.22 | 0.176 |
| 0.603185789489129 | 0.824 | 0.3 | 0.109 | 0.215 | 0.181 |
| 0.609468974796308 | 0.82 | 0.305 | 0.113 | 0.21 | 0.186 |
| 0.615752160103488 | 0.816 | 0.31 | 0.117 | 0.205 | 0.191 |
| 0.622035345410668 | 0.813 | 0.314 | 0.122 | 0.2 | 0.196 |
| 0.628318530717847 | 0.809 | 0.319 | 0.126 | 0.194 | 0.201 |
| 0.634601716025027 | 0.805 | 0.324 | 0.131 | 0.189 | 0.206 |
| 0.640884901332206 | 0.802 | 0.329 | 0.135 | 0.183 | 0.211 |
| 0.647168086639386 | 0.798 | 0.334 | 0.14 | 0.177 | 0.216 |
| 0.653451271946566 | 0.794 | 0.339 | 0.145 | 0.17 | 0.222 |
| 0.659734457253745 | 0.79 | 0.344 | 0.15 | 0.164 | 0.227 |
| 0.666017642560925 | 0.786 | 0.349 | 0.155 | 0.158 | 0.232 |
| 0.672300827868105 | 0.782 | 0.354 | 0.16 | 0.151 | 0.238 |
| 0.678584013175284 | 0.778 | 0.358 | 0.165 | 0.144 | 0.243 |
| 0.684867198482464 | 0.775 | 0.363 | 0.17 | 0.137 | 0.249 |
| 0.691150383789644 | 0.771 | 0.368 | 0.176 | 0.13 | 0.254 |
| 0.697433569096823 | 0.766 | 0.373 | 0.181 | 0.122 | 0.26 |
| 0.703716754404003 | 0.762 | 0.378 | 0.187 | 0.114 | 0.266 |
| 0.709999939711183 | 0.758 | 0.382 | 0.193 | 0.107 | 0.271 |
| 0.716283125018362 | 0.754 | 0.387 | 0.199 | 0.099 | 0.277 |
| 0.722566310325542 | 0.75 | 0.392 | 0.204 | 0.091 | 0.283 |
| 0.728849495632721 | 0.746 | 0.396 | 0.211 | 0.082 | 0.289 |
| 0.735132680939901 | 0.742 | 0.401 | 0.217 | 0.074 | 0.295 |
| 0.741415866247081 | 0.738 | 0.405 | 0.223 | 0.065 | 0.301 |
| 0.74769905155426 | 0.733 | 0.41 | 0.229 | 0.056 | 0.307 |
| 0.75398223686144 | 0.729 | 0.414 | 0.236 | 0.047 | 0.312 |
| 0.76026542216862 | 0.725 | 0.419 | 0.242 | 0.038 | 0.318 |
| 0.766548607475799 | 0.72 | 0.423 | 0.249 | 0.029 | 0.324 |
| 0.772831792782979 | 0.716 | 0.428 | 0.255 | 0.019 | 0.33 |
| 0.779114978090159 | 0.712 | 0.432 | 0.262 | 0.01 | 0.337 |
| 0.785398163397338 | 0.707 | 0.436 | 0.269 | 0 | 0.343 |
| 0.791681348704518 | 0.703 | 0.44 | 0.276 | -0.01 | 0.349 |
| 0.797964534011697 | 0.698 | 0.445 | 0.283 | -0.02 | 0.355 |
| 0.804247719318877 | 0.694 | 0.449 | 0.29 | -0.03 | 0.361 |
| 0.810530904626057 | 0.689 | 0.453 | 0.297 | -0.041 | 0.367 |
| 0.816814089933236 | 0.685 | 0.457 | 0.305 | -0.051 | 0.373 |
| 0.823097275240416 | 0.68 | 0.461 | 0.312 | -0.062 | 0.379 |
| 0.829380460547596 | 0.675 | 0.465 | 0.32 | -0.073 | 0.385 |
| 0.835663645854775 | 0.671 | 0.468 | 0.327 | -0.084 | 0.391 |
| 0.841946831161955 | 0.666 | 0.472 | 0.335 | -0.095 | 0.397 |
| 0.848230016469135 | 0.661 | 0.476 | 0.342 | -0.106 | 0.404 |
| 0.854513201776314 | 0.657 | 0.479 | 0.35 | -0.118 | 0.41 |
| 0.860796387083494 | 0.652 | 0.483 | 0.358 | -0.129 | 0.416 |
| 0.867079572390674 | 0.647 | 0.486 | 0.366 | -0.141 | 0.422 |
| 0.873362757697853 | 0.642 | 0.49 | 0.374 | -0.153 | 0.428 |
| 0.879645943005033 | 0.637 | 0.493 | 0.382 | -0.165 | 0.434 |
| 0.885929128312212 | 0.633 | 0.496 | 0.39 | -0.177 | 0.44 |
| 0.892212313619392 | 0.628 | 0.5 | 0.398 | -0.189 | 0.446 |
| 0.898495498926572 | 0.623 | 0.503 | 0.406 | -0.202 | 0.452 |
| 0.904778684233751 | 0.618 | 0.506 | 0.414 | -0.214 | 0.458 |
| 0.911061869540931 | 0.613 | 0.509 | 0.422 | -0.227 | 0.463 |
| 0.917345054848111 | 0.608 | 0.512 | 0.431 | -0.239 | 0.469 |
| 0.92362824015529 | 0.603 | 0.514 | 0.439 | -0.252 | 0.475 |
| 0.92991142546247 | 0.598 | 0.517 | 0.447 | -0.265 | 0.481 |
| 0.93619461076965 | 0.593 | 0.52 | 0.455 | -0.278 | 0.486 |
| 0.942477796076829 | 0.588 | 0.522 | 0.464 | -0.291 | 0.492 |
| 0.948760981384009 | 0.583 | 0.525 | 0.472 | -0.304 | 0.498 |
| 0.955044166691188 | 0.578 | 0.527 | 0.481 | -0.318 | 0.503 |
| 0.961327351998368 | 0.572 | 0.529 | 0.489 | -0.331 | 0.509 |
| 0.967610537305548 | 0.567 | 0.531 | 0.497 | -0.345 | 0.514 |
| 0.973893722612727 | 0.562 | 0.533 | 0.506 | -0.359 | 0.519 |
| 0.980176907919907 | 0.557 | 0.535 | 0.514 | -0.372 | 0.524 |
| 0.986460093227087 | 0.552 | 0.537 | 0.522 | -0.386 | 0.53 |
| 0.992743278534266 | 0.546 | 0.538 | 0.531 | -0.4 | 0.535 |
| 0.999026463841446 | 0.541 | 0.54 | 0.539 | -0.414 | 0.54 |
| 1.005309649148626 | 0.536 | 0.542 | 0.547 | -0.428 | 0.544 |
| 1.011592834455805 | 0.531 | 0.543 | 0.556 | -0.442 | 0.549 |
| 1.017876019762985 | 0.525 | 0.544 | 0.564 | -0.456 | 0.554 |
| 1.024159205070164 | 0.52 | 0.545 | 0.572 | -0.471 | 0.558 |
| 1.030442390377344 | 0.514 | 0.546 | 0.58 | -0.485 | 0.563 |
| 1.036725575684524 | 0.509 | 0.547 | 0.588 | -0.499 | 0.567 |
| 1.043008760991703 | 0.504 | 0.548 | 0.596 | -0.514 | 0.571 |
| 1.049291946298883 | 0.498 | 0.549 | 0.604 | -0.528 | 0.576 |
| 1.055575131606063 | 0.493 | 0.549 | 0.612 | -0.543 | 0.58 |
| 1.061858316913242 | 0.487 | 0.549 | 0.619 | -0.558 | 0.583 |
| 1.068141502220422 | 0.482 | 0.55 | 0.627 | -0.572 | 0.587 |
| 1.074424687527602 | 0.476 | 0.55 | 0.635 | -0.587 | 0.591 |
| 1.080707872834781 | 0.471 | 0.55 | 0.642 | -0.602 | 0.594 |
| 1.086991058141961 | 0.465 | 0.55 | 0.649 | -0.617 | 0.597 |
| 1.09327424344914 | 0.46 | 0.549 | 0.657 | -0.631 | 0.601 |
| 1.09955742875632 | 0.454 | 0.549 | 0.664 | -0.646 | 0.604 |
| 1.1058406140635 | 0.448 | 0.548 | 0.671 | -0.661 | 0.606 |
| 1.112123799370679 | 0.443 | 0.548 | 0.677 | -0.676 | 0.609 |
| 1.11840698467786 | 0.437 | 0.547 | 0.684 | -0.691 | 0.611 |
| 1.124690169985039 | 0.431 | 0.546 | 0.69 | -0.706 | 0.614 |
| 1.130973355292218 | 0.426 | 0.545 | 0.697 | -0.721 | 0.616 |
| 1.137256540599398 | 0.42 | 0.543 | 0.703 | -0.736 | 0.618 |
| 1.143539725906578 | 0.414 | 0.542 | 0.709 | -0.751 | 0.62 |
| 1.149822911213757 | 0.409 | 0.54 | 0.714 | -0.766 | 0.621 |
| 1.156106096520937 | 0.403 | 0.539 | 0.72 | -0.781 | 0.623 |
| 1.162389281828116 | 0.397 | 0.537 | 0.725 | -0.796 | 0.624 |
| 1.168672467135296 | 0.391 | 0.535 | 0.73 | -0.811 | 0.625 |
| 1.174955652442476 | 0.386 | 0.532 | 0.735 | -0.826 | 0.625 |
| 1.181238837749655 | 0.38 | 0.53 | 0.739 | -0.84 | 0.626 |
| 1.187522023056835 | 0.374 | 0.527 | 0.744 | -0.855 | 0.626 |
| 1.193805208364015 | 0.368 | 0.525 | 0.748 | -0.87 | 0.626 |
| 1.200088393671194 | 0.362 | 0.522 | 0.751 | -0.885 | 0.626 |
| 1.206371578978374 | 0.356 | 0.519 | 0.755 | -0.9 | 0.626 |
| 1.212654764285554 | 0.351 | 0.515 | 0.758 | -0.915 | 0.625 |
| 1.218937949592733 | 0.345 | 0.512 | 0.761 | -0.929 | 0.624 |
| 1.225221134899913 | 0.339 | 0.509 | 0.763 | -0.944 | 0.623 |
| 1.231504320207093 | 0.333 | 0.505 | 0.766 | -0.959 | 0.622 |
| 1.237787505514272 | 0.327 | 0.501 | 0.767 | -0.973 | 0.62 |
| 1.244070690821452 | 0.321 | 0.497 | 0.769 | -0.988 | 0.618 |
| 1.250353876128631 | 0.315 | 0.492 | 0.77 | -1.002 | 0.616 |
| 1.256637061435811 | 0.309 | 0.488 | 0.771 | -1.017 | 0.613 |
| 1.262920246742991 | 0.303 | 0.483 | 0.771 | -1.031 | 0.61 |
| 1.26920343205017 | 0.297 | 0.478 | 0.771 | -1.045 | 0.607 |
| 1.27548661735735 | 0.291 | 0.473 | 0.77 | -1.059 | 0.604 |
| 1.28176980266453 | 0.285 | 0.468 | 0.769 | -1.074 | 0.6 |
| 1.28805298797171 | 0.279 | 0.463 | 0.768 | -1.088 | 0.596 |
| 1.294336173278889 | 0.273 | 0.457 | 0.766 | -1.101 | 0.592 |
| 1.300619358586069 | 0.267 | 0.451 | 0.764 | -1.115 | 0.587 |
| 1.306902543893248 | 0.261 | 0.446 | 0.761 | -1.129 | 0.582 |
| 1.313185729200428 | 0.255 | 0.439 | 0.758 | -1.143 | 0.577 |
| 1.319468914507607 | 0.249 | 0.433 | 0.754 | -1.156 | 0.571 |
| 1.325752099814787 | 0.243 | 0.426 | 0.749 | -1.17 | 0.565 |
| 1.332035285121967 | 0.236 | 0.42 | 0.745 | -1.183 | 0.559 |
| 1.338318470429146 | 0.23 | 0.413 | 0.739 | -1.196 | 0.552 |
| 1.344601655736326 | 0.224 | 0.405 | 0.733 | -1.209 | 0.545 |
| 1.350884841043506 | 0.218 | 0.398 | 0.726 | -1.222 | 0.538 |
| 1.357168026350685 | 0.212 | 0.39 | 0.719 | -1.235 | 0.53 |
| 1.363451211657865 | 0.206 | 0.383 | 0.711 | -1.248 | 0.522 |
| 1.369734396965045 | 0.2 | 0.375 | 0.703 | -1.26 | 0.513 |
| 1.376017582272224 | 0.194 | 0.366 | 0.694 | -1.273 | 0.504 |
| 1.382300767579404 | 0.187 | 0.358 | 0.684 | -1.285 | 0.495 |
| 1.388583952886583 | 0.181 | 0.349 | 0.674 | -1.297 | 0.485 |
| 1.394867138193763 | 0.175 | 0.341 | 0.663 | -1.309 | 0.475 |
| 1.401150323500943 | 0.169 | 0.331 | 0.651 | -1.321 | 0.464 |
| 1.407433508808122 | 0.163 | 0.322 | 0.638 | -1.333 | 0.453 |
| 1.413716694115302 | 0.156 | 0.313 | 0.625 | -1.345 | 0.442 |
| 1.419999879422482 | 0.15 | 0.303 | 0.611 | -1.356 | 0.43 |
| 1.426283064729661 | 0.144 | 0.293 | 0.596 | -1.367 | 0.418 |
| 1.432566250036841 | 0.138 | 0.283 | 0.58 | -1.378 | 0.405 |
| 1.438849435344021 | 0.132 | 0.272 | 0.564 | -1.389 | 0.392 |
| 1.4451326206512 | 0.125 | 0.262 | 0.547 | -1.4 | 0.378 |
| 1.45141580595838 | 0.119 | 0.251 | 0.529 | -1.41 | 0.364 |
| 1.45769899126556 | 0.113 | 0.24 | 0.51 | -1.421 | 0.35 |
| 1.46398217657274 | 0.107 | 0.228 | 0.49 | -1.431 | 0.335 |
| 1.470265361879919 | 0.1 | 0.217 | 0.469 | -1.441 | 0.319 |
| 1.476548547187098 | 0.094 | 0.205 | 0.447 | -1.45 | 0.303 |
| 1.482831732494278 | 0.088 | 0.193 | 0.425 | -1.46 | 0.286 |
| 1.489114917801458 | 0.082 | 0.181 | 0.401 | -1.469 | 0.269 |
| 1.495398103108637 | 0.075 | 0.168 | 0.377 | -1.478 | 0.252 |
| 1.501681288415817 | 0.069 | 0.156 | 0.351 | -1.487 | 0.234 |
| 1.507964473722997 | 0.063 | 0.143 | 0.325 | -1.496 | 0.215 |
| 1.514247659030176 | 0.057 | 0.13 | 0.297 | -1.505 | 0.196 |
| 1.520530844337356 | 0.05 | 0.116 | 0.269 | -1.513 | 0.177 |
| 1.526814029644536 | 0.044 | 0.102 | 0.239 | -1.521 | 0.156 |
| 1.533097214951715 | 0.038 | 0.089 | 0.208 | -1.529 | 0.136 |
| 1.539380400258895 | 0.031 | 0.074 | 0.176 | -1.536 | 0.115 |
| 1.545663585566075 | 0.025 | 0.06 | 0.143 | -1.544 | 0.093 |
| 1.551946770873254 | 0.019 | 0.045 | 0.109 | -1.551 | 0.07 |
| 1.558229956180434 | 0.013 | 0.031 | 0.074 | -1.558 | 0.048 |
| 1.564513141487613 | 0.006 | 0.015 | 0.038 | -1.564 | 0.024 |
| 1.570796326794793 | 0 | 0 | 0 | -1.571 | 0 |
| 1.577079512101973 | -0.006 | -0.016 | -0.039 | -1.577 | -0.025 |
| 1.583362697409152 | -0.013 | -0.032 | -0.079 | -1.583 | -0.05 |
| 1.589645882716332 | -0.019 | -0.048 | -0.12 | -1.589 | -0.076 |
| 1.595929068023512 | -0.025 | -0.064 | -0.163 | -1.594 | -0.102 |
| 1.602212253330691 | -0.031 | -0.081 | -0.207 | -1.599 | -0.129 |
| 1.608495438637871 | -0.038 | -0.098 | -0.252 | -1.604 | -0.157 |
| 1.61477862394505 | -0.044 | -0.115 | -0.299 | -1.609 | -0.185 |
| 1.62106180925223 | -0.05 | -0.132 | -0.347 | -1.613 | -0.214 |
| 1.62734499455941 | -0.057 | -0.15 | -0.396 | -1.617 | -0.244 |
| 1.633628179866589 | -0.063 | -0.168 | -0.447 | -1.621 | -0.274 |
| 1.63991136517377 | -0.069 | -0.186 | -0.499 | -1.624 | -0.305 |
| 1.646194550480949 | -0.075 | -0.204 | -0.553 | -1.628 | -0.336 |
| 1.652477735788128 | -0.082 | -0.223 | -0.608 | -1.63 | -0.368 |
| 1.658760921095308 | -0.088 | -0.242 | -0.665 | -1.633 | -0.401 |
| 1.665044106402488 | -0.094 | -0.261 | -0.723 | -1.636 | -0.434 |
| 1.671327291709667 | -0.1 | -0.28 | -0.783 | -1.638 | -0.469 |
| 1.677610477016847 | -0.107 | -0.3 | -0.844 | -1.639 | -0.503 |
| 1.683893662324026 | -0.113 | -0.32 | -0.907 | -1.641 | -0.539 |
| 1.690176847631206 | -0.119 | -0.34 | -0.972 | -1.642 | -0.575 |
| 1.696460032938386 | -0.125 | -0.361 | -1.038 | -1.643 | -0.612 |
| 1.702743218245565 | -0.132 | -0.381 | -1.106 | -1.644 | -0.65 |
| 1.709026403552745 | -0.138 | -0.402 | -1.175 | -1.644 | -0.688 |
| 1.715309588859925 | -0.144 | -0.424 | -1.247 | -1.644 | -0.727 |
| 1.721592774167104 | -0.15 | -0.445 | -1.32 | -1.644 | -0.767 |
| 1.727875959474284 | -0.156 | -0.467 | -1.394 | -1.643 | -0.807 |
| 1.734159144781464 | -0.163 | -0.489 | -1.471 | -1.642 | -0.848 |
| 1.740442330088643 | -0.169 | -0.511 | -1.549 | -1.641 | -0.89 |
| 1.746725515395823 | -0.175 | -0.534 | -1.629 | -1.64 | -0.933 |
| 1.753008700703003 | -0.181 | -0.557 | -1.711 | -1.638 | -0.976 |
| 1.759291886010182 | -0.187 | -0.58 | -1.795 | -1.636 | -1.02 |
| 1.765575071317362 | -0.194 | -0.603 | -1.881 | -1.633 | -1.065 |
| 1.771858256624541 | -0.2 | -0.627 | -1.968 | -1.631 | -1.111 |
| 1.778141441931721 | -0.206 | -0.651 | -2.058 | -1.627 | -1.157 |
| 1.784424627238901 | -0.212 | -0.675 | -2.15 | -1.624 | -1.205 |
| 1.79070781254608 | -0.218 | -0.7 | -2.243 | -1.62 | -1.253 |
| 1.79699099785326 | -0.224 | -0.724 | -2.339 | -1.616 | -1.301 |
| 1.80327418316044 | -0.23 | -0.749 | -2.436 | -1.612 | -1.351 |
| 1.809557368467619 | -0.236 | -0.774 | -2.536 | -1.607 | -1.401 |
| 1.815840553774799 | -0.243 | -0.8 | -2.638 | -1.602 | -1.453 |
| 1.822123739081979 | -0.249 | -0.826 | -2.741 | -1.597 | -1.504 |
| 1.828406924389158 | -0.255 | -0.852 | -2.847 | -1.591 | -1.557 |
| 1.834690109696338 | -0.261 | -0.878 | -2.955 | -1.585 | -1.611 |
| 1.840973295003518 | -0.267 | -0.905 | -3.066 | -1.579 | -1.665 |
| 1.847256480310697 | -0.273 | -0.931 | -3.178 | -1.572 | -1.721 |
| 1.853539665617877 | -0.279 | -0.959 | -3.293 | -1.565 | -1.777 |
| 1.859822850925056 | -0.285 | -0.986 | -3.41 | -1.558 | -1.834 |
| 1.866106036232236 | -0.291 | -1.013 | -3.529 | -1.55 | -1.891 |
| 1.872389221539416 | -0.297 | -1.041 | -3.651 | -1.542 | -1.95 |
| 1.878672406846595 | -0.303 | -1.07 | -3.775 | -1.534 | -2.009 |
| 1.884955592153775 | -0.309 | -1.098 | -3.901 | -1.525 | -2.07 |
| 1.891238777460955 | -0.315 | -1.127 | -4.03 | -1.516 | -2.131 |
| 1.897521962768134 | -0.321 | -1.156 | -4.161 | -1.507 | -2.193 |
| 1.903805148075314 | -0.327 | -1.185 | -4.294 | -1.497 | -2.256 |
| 1.910088333382494 | -0.333 | -1.214 | -4.43 | -1.487 | -2.319 |
| 1.916371518689673 | -0.339 | -1.244 | -4.569 | -1.477 | -2.384 |
| 1.922654703996853 | -0.345 | -1.274 | -4.709 | -1.466 | -2.449 |
| 1.928937889304033 | -0.351 | -1.304 | -4.853 | -1.455 | -2.516 |
| 1.935221074611212 | -0.356 | -1.335 | -4.999 | -1.444 | -2.583 |
| 1.941504259918392 | -0.362 | -1.366 | -5.147 | -1.432 | -2.651 |
| 1.947787445225571 | -0.368 | -1.397 | -5.299 | -1.42 | -2.72 |
| 1.954070630532751 | -0.374 | -1.428 | -5.452 | -1.408 | -2.79 |
| 1.960353815839931 | -0.38 | -1.459 | -5.609 | -1.395 | -2.861 |
| 1.96663700114711 | -0.386 | -1.491 | -5.768 | -1.382 | -2.933 |
| 1.97292018645429 | -0.391 | -1.523 | -5.93 | -1.369 | -3.006 |
| 1.97920337176147 | -0.397 | -1.556 | -6.094 | -1.355 | -3.079 |
| 1.985486557068649 | -0.403 | -1.588 | -6.261 | -1.341 | -3.154 |
| 1.991769742375829 | -0.409 | -1.621 | -6.431 | -1.327 | -3.229 |
| 1.998052927683009 | -0.414 | -1.654 | -6.604 | -1.312 | -3.305 |
| 2.004336112990188 | -0.42 | -1.688 | -6.78 | -1.297 | -3.383 |
| 2.010619298297368 | -0.426 | -1.721 | -6.958 | -1.282 | -3.461 |
| 2.016902483604547 | -0.431 | -1.755 | -7.14 | -1.266 | -3.54 |
| 2.023185668911727 | -0.437 | -1.789 | -7.324 | -1.25 | -3.62 |
| 2.029468854218907 | -0.443 | -1.824 | -7.511 | -1.234 | -3.701 |
| 2.035752039526086 | -0.448 | -1.858 | -7.701 | -1.217 | -3.783 |
| 2.042035224833266 | -0.454 | -1.893 | -7.894 | -1.2 | -3.866 |
| 2.048318410140446 | -0.46 | -1.928 | -8.09 | -1.183 | -3.95 |
| 2.054601595447625 | -0.465 | -1.964 | -8.289 | -1.166 | -4.034 |
| 2.060884780754805 | -0.471 | -1.999 | -8.491 | -1.148 | -4.12 |
| 2.067167966061984 | -0.476 | -2.035 | -8.696 | -1.129 | -4.207 |
| 2.073451151369164 | -0.482 | -2.071 | -8.904 | -1.111 | -4.294 |
| 2.079734336676344 | -0.487 | -2.108 | -9.116 | -1.092 | -4.383 |
| 2.086017521983524 | -0.493 | -2.144 | -9.33 | -1.073 | -4.473 |
| 2.092300707290703 | -0.498 | -2.181 | -9.547 | -1.054 | -4.563 |
| 2.098583892597883 | -0.504 | -2.218 | -9.768 | -1.034 | -4.655 |
| 2.104867077905062 | -0.509 | -2.255 | -9.992 | -1.014 | -4.747 |
| 2.111150263212242 | -0.514 | -2.293 | -10.219 | -0.994 | -4.841 |
| 2.117433448519422 | -0.52 | -2.331 | -10.449 | -0.973 | -4.935 |
| 2.123716633826601 | -0.525 | -2.369 | -10.683 | -0.952 | -5.03 |
| 2.129999819133781 | -0.531 | -2.407 | -10.92 | -0.931 | -5.127 |
| 2.136283004440961 | -0.536 | -2.445 | -11.16 | -0.91 | -5.224 |
| 2.14256618974814 | -0.541 | -2.484 | -11.403 | -0.888 | -5.322 |
| 2.14884937505532 | -0.546 | -2.523 | -11.65 | -0.866 | -5.422 |
| 2.1551325603625 | -0.552 | -2.562 | -11.9 | -0.843 | -5.522 |
| 2.16141574566968 | -0.557 | -2.602 | -12.154 | -0.821 | -5.623 |
| 2.167698930976859 | -0.562 | -2.641 | -12.411 | -0.798 | -5.725 |
| 2.173982116284038 | -0.567 | -2.681 | -12.671 | -0.775 | -5.829 |
| 2.180265301591218 | -0.572 | -2.721 | -12.935 | -0.751 | -5.933 |
| 2.186548486898398 | -0.578 | -2.761 | -13.202 | -0.728 | -6.038 |
| 2.192831672205577 | -0.583 | -2.802 | -13.473 | -0.704 | -6.144 |
| 2.199114857512757 | -0.588 | -2.843 | -13.747 | -0.68 | -6.251 |
| 2.205398042819936 | -0.593 | -2.884 | -14.025 | -0.655 | -6.359 |
| 2.211681228127116 | -0.598 | -2.925 | -14.306 | -0.63 | -6.468 |
| 2.217964413434296 | -0.603 | -2.966 | -14.591 | -0.605 | -6.579 |
| 2.224247598741475 | -0.608 | -3.008 | -14.879 | -0.58 | -6.69 |
| 2.230530784048655 | -0.613 | -3.049 | -15.171 | -0.555 | -6.802 |
| 2.236813969355835 | -0.618 | -3.091 | -15.467 | -0.529 | -6.915 |
| 2.243097154663014 | -0.623 | -3.134 | -15.766 | -0.503 | -7.029 |
| 2.249380339970194 | -0.628 | -3.176 | -16.069 | -0.477 | -7.144 |
| 2.255663525277374 | -0.633 | -3.219 | -16.376 | -0.45 | -7.26 |
| 2.261946710584553 | -0.637 | -3.261 | -16.686 | -0.424 | -7.377 |
| 2.268229895891733 | -0.642 | -3.304 | -17 | -0.397 | -7.495 |
| 2.274513081198912 | -0.647 | -3.347 | -17.318 | -0.37 | -7.614 |
| 2.280796266506092 | -0.652 | -3.391 | -17.639 | -0.343 | -7.734 |
| 2.287079451813272 | -0.657 | -3.434 | -17.965 | -0.315 | -7.855 |
| 2.293362637120452 | -0.661 | -3.478 | -18.294 | -0.287 | -7.977 |
| 2.299645822427631 | -0.666 | -3.522 | -18.626 | -0.26 | -8.1 |
| 2.305929007734811 | -0.671 | -3.566 | -18.963 | -0.231 | -8.224 |
| 2.312212193041991 | -0.675 | -3.611 | -19.303 | -0.203 | -8.348 |
| 2.31849537834917 | -0.68 | -3.655 | -19.647 | -0.175 | -8.474 |
| 2.32477856365635 | -0.685 | -3.7 | -19.995 | -0.146 | -8.601 |
| 2.331061748963529 | -0.689 | -3.745 | -20.347 | -0.117 | -8.729 |
| 2.337344934270709 | -0.694 | -3.79 | -20.703 | -0.088 | -8.857 |
| 2.343628119577889 | -0.698 | -3.835 | -21.063 | -0.059 | -8.987 |
| 2.349911304885068 | -0.703 | -3.88 | -21.426 | -0.03 | -9.118 |
| 2.356194490192248 | -0.707 | -3.926 | -21.794 | 0 | -9.25 |
| 2.362477675499428 | -0.712 | -3.971 | -22.165 | 0.03 | -9.382 |
| 2.368760860806607 | -0.716 | -4.017 | -22.54 | 0.06 | -9.516 |
| 2.375044046113787 | -0.72 | -4.063 | -22.92 | 0.09 | -9.65 |
| 2.381327231420966 | -0.725 | -4.109 | -23.303 | 0.12 | -9.786 |
| 2.387610416728146 | -0.729 | -4.156 | -23.69 | 0.15 | -9.922 |
| 2.393893602035326 | -0.733 | -4.202 | -24.081 | 0.18 | -10.059 |
| 2.400176787342505 | -0.738 | -4.249 | -24.476 | 0.211 | -10.198 |
| 2.406459972649685 | -0.742 | -4.295 | -24.875 | 0.242 | -10.337 |
| 2.412743157956865 | -0.746 | -4.342 | -25.278 | 0.272 | -10.477 |
| 2.419026343264044 | -0.75 | -4.389 | -25.685 | 0.303 | -10.618 |
| 2.425309528571224 | -0.754 | -4.437 | -26.097 | 0.334 | -10.76 |
| 2.431592713878404 | -0.758 | -4.484 | -26.512 | 0.365 | -10.903 |
| 2.437875899185583 | -0.762 | -4.531 | -26.931 | 0.396 | -11.047 |
| 2.444159084492763 | -0.766 | -4.579 | -27.354 | 0.428 | -11.192 |
| 2.450442269799943 | -0.771 | -4.627 | -27.782 | 0.459 | -11.337 |
| 2.456725455107122 | -0.775 | -4.675 | -28.213 | 0.491 | -11.484 |
| 2.463008640414302 | -0.778 | -4.722 | -28.648 | 0.522 | -11.631 |
| 2.469291825721482 | -0.782 | -4.771 | -29.088 | 0.554 | -11.78 |
| 2.475575011028661 | -0.786 | -4.819 | -29.532 | 0.585 | -11.929 |
| 2.481858196335841 | -0.79 | -4.867 | -29.979 | 0.617 | -12.079 |
| 2.48814138164302 | -0.794 | -4.915 | -30.431 | 0.649 | -12.23 |
| 2.4944245669502 | -0.798 | -4.964 | -30.887 | 0.681 | -12.382 |
| 2.50070775225738 | -0.802 | -5.013 | -31.347 | 0.713 | -12.535 |
| 2.506990937564559 | -0.805 | -5.061 | -31.811 | 0.745 | -12.689 |
| 2.51327412287174 | -0.809 | -5.11 | -32.279 | 0.777 | -12.843 |
| 2.519557308178919 | -0.813 | -5.159 | -32.751 | 0.809 | -12.999 |
| 2.525840493486098 | -0.816 | -5.208 | -33.227 | 0.841 | -13.155 |
| 2.532123678793278 | -0.82 | -5.257 | -33.708 | 0.873 | -13.312 |
| 2.538406864100458 | -0.824 | -5.306 | -34.192 | 0.905 | -13.47 |
| 2.544690049407637 | -0.827 | -5.356 | -34.681 | 0.937 | -13.629 |
| 2.550973234714817 | -0.831 | -5.405 | -35.173 | 0.969 | -13.788 |
| 2.557256420021996 | -0.834 | -5.455 | -35.67 | 1.001 | -13.949 |
| 2.563539605329176 | -0.838 | -5.504 | -36.171 | 1.033 | -14.11 |
| 2.569822790636356 | -0.841 | -5.554 | -36.676 | 1.065 | -14.272 |
| 2.576105975943535 | -0.844 | -5.603 | -37.185 | 1.097 | -14.435 |
| 2.582389161250715 | -0.848 | -5.653 | -37.698 | 1.129 | -14.598 |
| 2.588672346557895 | -0.851 | -5.703 | -38.215 | 1.161 | -14.762 |
| 2.594955531865074 | -0.854 | -5.753 | -38.736 | 1.193 | -14.928 |
| 2.601238717172254 | -0.858 | -5.802 | -39.262 | 1.224 | -15.093 |
| 2.607521902479433 | -0.861 | -5.852 | -39.791 | 1.256 | -15.26 |
| 2.613805087786613 | -0.864 | -5.902 | -40.324 | 1.288 | -15.427 |
| 2.620088273093793 | -0.867 | -5.952 | -40.862 | 1.32 | -15.596 |
| 2.626371458400972 | -0.87 | -6.002 | -41.403 | 1.351 | -15.764 |
| 2.632654643708152 | -0.873 | -6.052 | -41.949 | 1.383 | -15.934 |
| 2.638937829015332 | -0.876 | -6.103 | -42.498 | 1.414 | -16.104 |
| 2.645221014322511 | -0.879 | -6.153 | -43.052 | 1.445 | -16.275 |
| 2.651504199629691 | -0.882 | -6.203 | -43.61 | 1.477 | -16.447 |
| 2.657787384936871 | -0.885 | -6.253 | -44.171 | 1.508 | -16.619 |
| 2.66407057024405 | -0.888 | -6.303 | -44.737 | 1.539 | -16.793 |
| 2.67035375555123 | -0.891 | -6.354 | -45.306 | 1.57 | -16.966 |
| 2.67663694085841 | -0.894 | -6.404 | -45.879 | 1.6 | -17.141 |
| 2.682920126165589 | -0.897 | -6.454 | -46.457 | 1.631 | -17.316 |
| 2.689203311472769 | -0.899 | -6.504 | -47.038 | 1.662 | -17.491 |
| 2.695486496779948 | -0.902 | -6.555 | -47.623 | 1.692 | -17.668 |
| 2.701769682087128 | -0.905 | -6.605 | -48.212 | 1.722 | -17.845 |
| 2.708052867394308 | -0.907 | -6.655 | -48.805 | 1.752 | -18.022 |
| 2.714336052701487 | -0.91 | -6.705 | -49.402 | 1.782 | -18.2 |
| 2.720619238008667 | -0.913 | -6.756 | -50.003 | 1.812 | -18.379 |
| 2.726902423315847 | -0.915 | -6.806 | -50.607 | 1.842 | -18.559 |
| 2.733185608623026 | -0.918 | -6.856 | -51.216 | 1.871 | -18.738 |
| 2.739468793930206 | -0.92 | -6.906 | -51.828 | 1.9 | -18.919 |
| 2.745751979237386 | -0.923 | -6.956 | -52.444 | 1.929 | -19.1 |
| 2.752035164544565 | -0.925 | -7.006 | -53.063 | 1.958 | -19.281 |
| 2.758318349851745 | -0.927 | -7.056 | -53.687 | 1.987 | -19.464 |
| 2.764601535158925 | -0.93 | -7.106 | -54.314 | 2.015 | -19.646 |
| 2.770884720466104 | -0.932 | -7.156 | -54.944 | 2.044 | -19.829 |
| 2.777167905773284 | -0.934 | -7.206 | -55.579 | 2.072 | -20.013 |
| 2.783451091080463 | -0.937 | -7.256 | -56.217 | 2.099 | -20.197 |
| 2.789734276387643 | -0.939 | -7.306 | -56.858 | 2.127 | -20.381 |
| 2.796017461694823 | -0.941 | -7.356 | -57.503 | 2.154 | -20.566 |
| 2.802300647002002 | -0.943 | -7.405 | -58.152 | 2.181 | -20.752 |
| 2.808583832309182 | -0.945 | -7.455 | -58.804 | 2.208 | -20.937 |
| 2.814867017616362 | -0.947 | -7.504 | -59.46 | 2.235 | -21.124 |
| 2.821150202923541 | -0.949 | -7.554 | -60.119 | 2.261 | -21.31 |
| 2.827433388230721 | -0.951 | -7.603 | -60.782 | 2.287 | -21.497 |
| 2.833716573537901 | -0.953 | -7.652 | -61.448 | 2.313 | -21.685 |
| 2.83999975884508 | -0.955 | -7.702 | -62.118 | 2.339 | -21.872 |
| 2.84628294415226 | -0.957 | -7.751 | -62.79 | 2.364 | -22.061 |
| 2.852566129459439 | -0.959 | -7.8 | -63.467 | 2.389 | -22.249 |
| 2.858849314766619 | -0.96 | -7.848 | -64.146 | 2.414 | -22.438 |
| 2.865132500073799 | -0.962 | -7.897 | -64.829 | 2.438 | -22.627 |
| 2.871415685380978 | -0.964 | -7.946 | -65.514 | 2.462 | -22.816 |
| 2.877698870688158 | -0.965 | -7.994 | -66.203 | 2.486 | -23.006 |
| 2.883982055995337 | -0.967 | -8.043 | -66.896 | 2.51 | -23.196 |
| 2.890265241302517 | -0.969 | -8.091 | -67.591 | 2.533 | -23.386 |
| 2.896548426609697 | -0.97 | -8.139 | -68.289 | 2.556 | -23.576 |
| 2.902831611916877 | -0.972 | -8.187 | -68.99 | 2.578 | -23.767 |
| 2.909114797224056 | -0.973 | -8.235 | -69.695 | 2.6 | -23.957 |
| 2.915397982531236 | -0.975 | -8.283 | -70.402 | 2.622 | -24.148 |
| 2.921681167838416 | -0.976 | -8.331 | -71.112 | 2.644 | -24.339 |
| 2.927964353145595 | -0.977 | -8.378 | -71.825 | 2.665 | -24.531 |
| 2.934247538452775 | -0.979 | -8.425 | -72.541 | 2.686 | -24.722 |
| 2.940530723759954 | -0.98 | -8.473 | -73.26 | 2.706 | -24.914 |
| 2.946813909067134 | -0.981 | -8.52 | -73.981 | 2.726 | -25.105 |
| 2.953097094374314 | -0.982 | -8.566 | -74.705 | 2.746 | -25.297 |
| 2.959380279681493 | -0.983 | -8.613 | -75.432 | 2.765 | -25.489 |
| 2.965663464988673 | -0.985 | -8.659 | -76.161 | 2.784 | -25.681 |
| 2.971946650295853 | -0.986 | -8.706 | -76.893 | 2.803 | -25.873 |
| 2.978229835603032 | -0.987 | -8.752 | -77.627 | 2.821 | -26.065 |
| 2.984513020910212 | -0.988 | -8.798 | -78.364 | 2.838 | -26.257 |
| 2.990796206217391 | -0.989 | -8.843 | -79.103 | 2.856 | -26.449 |
| 2.997079391524571 | -0.99 | -8.889 | -79.844 | 2.873 | -26.641 |
| 3.003362576831751 | -0.99 | -8.934 | -80.588 | 2.889 | -26.832 |
| 3.009645762138931 | -0.991 | -8.979 | -81.334 | 2.905 | -27.024 |
| 3.01592894744611 | -0.992 | -9.024 | -82.082 | 2.921 | -27.216 |
| 3.02221213275329 | -0.993 | -9.069 | -82.832 | 2.936 | -27.408 |
| 3.028495318060469 | -0.994 | -9.113 | -83.584 | 2.951 | -27.599 |
| 3.034778503367649 | -0.994 | -9.157 | -84.338 | 2.966 | -27.791 |
| 3.041061688674829 | -0.995 | -9.201 | -85.095 | 2.98 | -27.982 |
| 3.047344873982008 | -0.996 | -9.245 | -85.853 | 2.993 | -28.173 |
| 3.053628059289188 | -0.996 | -9.289 | -86.613 | 3.006 | -28.364 |
| 3.059911244596367 | -0.997 | -9.332 | -87.375 | 3.019 | -28.555 |
| 3.066194429903547 | -0.997 | -9.375 | -88.138 | 3.031 | -28.745 |
| 3.072477615210727 | -0.998 | -9.418 | -88.903 | 3.043 | -28.935 |
| 3.078760800517906 | -0.998 | -9.46 | -89.67 | 3.054 | -29.125 |
| 3.085043985825086 | -0.998 | -9.502 | -90.438 | 3.065 | -29.315 |
| 3.091327171132266 | -0.999 | -9.544 | -91.208 | 3.076 | -29.504 |
| 3.097610356439445 | -0.999 | -9.586 | -91.979 | 3.086 | -29.693 |
| 3.103893541746625 | -0.999 | -9.627 | -92.751 | 3.095 | -29.882 |
| 3.110176727053805 | -1 | -9.668 | -93.525 | 3.104 | -30.071 |
| 3.116459912360984 | -1 | -9.709 | -94.299 | 3.113 | -30.259 |
| 3.122743097668164 | -1 | -9.75 | -95.075 | 3.121 | -30.446 |
| 3.129026282975343 | -1 | -9.79 | -95.852 | 3.128 | -30.633 |
| 3.135309468282523 | -1 | -9.83 | -96.63 | 3.135 | -30.82 |
| 3.141592653589703 | -1 | -9.87 | -97.409 | 3.142 | -31.006 |
| 3.147875838896883 | -1 | -9.909 | -98.189 | 3.148 | -31.192 |
| 3.154159024204062 | -1 | -9.948 | -98.969 | 3.153 | -31.377 |
| 3.160442209511242 | -1 | -9.987 | -99.75 | 3.158 | -31.562 |
| 3.166725394818422 | -1 | -10.025 | -100.532 | 3.163 | -31.746 |
| 3.173008580125601 | -1 | -10.063 | -101.314 | 3.167 | -31.93 |
| 3.179291765432781 | -0.999 | -10.101 | -102.097 | 3.17 | -32.113 |
| 3.18557495073996 | -0.999 | -10.138 | -102.88 | 3.173 | -32.296 |
| 3.19185813604714 | -0.999 | -10.175 | -103.663 | 3.176 | -32.477 |
| 3.19814132135432 | -0.998 | -10.212 | -104.447 | 3.178 | -32.659 |
| 3.2044245066615 | -0.998 | -10.248 | -105.231 | 3.179 | -32.839 |
| 3.210707691968679 | -0.998 | -10.284 | -106.014 | 3.18 | -33.019 |
| 3.216990877275859 | -0.997 | -10.32 | -106.798 | 3.18 | -33.198 |
| 3.223274062583038 | -0.997 | -10.355 | -107.582 | 3.18 | -33.377 |
| 3.229557247890217 | -0.996 | -10.39 | -108.365 | 3.18 | -33.554 |
| 3.235840433197398 | -0.996 | -10.424 | -109.148 | 3.179 | -33.731 |
| 3.242123618504577 | -0.995 | -10.458 | -109.931 | 3.177 | -33.907 |
| 3.248406803811757 | -0.994 | -10.492 | -110.713 | 3.175 | -34.082 |
| 3.254689989118936 | -0.994 | -10.525 | -111.495 | 3.172 | -34.257 |
| 3.260973174426116 | -0.993 | -10.558 | -112.276 | 3.168 | -34.43 |
| 3.267256359733296 | -0.992 | -10.591 | -113.056 | 3.165 | -34.603 |
| 3.273539545040475 | -0.991 | -10.623 | -113.836 | 3.16 | -34.775 |
| 3.279822730347655 | -0.99 | -10.655 | -114.614 | 3.155 | -34.945 |
| 3.286105915654835 | -0.99 | -10.686 | -115.392 | 3.15 | -35.115 |
| 3.292389100962014 | -0.989 | -10.717 | -116.168 | 3.144 | -35.284 |
| 3.298672286269194 | -0.988 | -10.747 | -116.944 | 3.137 | -35.452 |
| 3.304955471576374 | -0.987 | -10.777 | -117.718 | 3.13 | -35.619 |
| 3.311238656883553 | -0.986 | -10.807 | -118.49 | 3.122 | -35.784 |
| 3.317521842190732 | -0.985 | -10.836 | -119.261 | 3.114 | -35.949 |
| 3.323805027497912 | -0.983 | -10.865 | -120.031 | 3.106 | -36.112 |
| 3.330088212805092 | -0.982 | -10.893 | -120.798 | 3.096 | -36.275 |
| 3.336371398112272 | -0.981 | -10.921 | -121.564 | 3.086 | -36.436 |
| 3.342654583419451 | -0.98 | -10.948 | -122.329 | 3.076 | -36.596 |
| 3.34893776872663 | -0.979 | -10.975 | -123.091 | 3.065 | -36.755 |
| 3.355220954033811 | -0.977 | -11.002 | -123.851 | 3.054 | -36.913 |
| 3.36150413934099 | -0.976 | -11.028 | -124.608 | 3.042 | -37.069 |
| 3.36778732464817 | -0.975 | -11.053 | -125.364 | 3.029 | -37.224 |
| 3.37407050995535 | -0.973 | -11.078 | -126.117 | 3.016 | -37.378 |
| 3.380353695262529 | -0.972 | -11.103 | -126.867 | 3.002 | -37.531 |
| 3.386636880569709 | -0.97 | -11.127 | -127.615 | 2.988 | -37.682 |
| 3.392920065876888 | -0.969 | -11.15 | -128.361 | 2.973 | -37.832 |
| 3.399203251184068 | -0.967 | -11.173 | -129.103 | 2.958 | -37.98 |
| 3.405486436491248 | -0.965 | -11.196 | -129.842 | 2.942 | -38.127 |
| 3.411769621798427 | -0.964 | -11.218 | -130.578 | 2.926 | -38.273 |
| 3.418052807105607 | -0.962 | -11.239 | -131.311 | 2.909 | -38.417 |
| 3.424335992412787 | -0.96 | -11.26 | -132.041 | 2.891 | -38.56 |
| 3.430619177719966 | -0.959 | -11.281 | -132.768 | 2.873 | -38.701 |
| 3.436902363027146 | -0.957 | -11.301 | -133.49 | 2.855 | -38.84 |
| 3.443185548334325 | -0.955 | -11.32 | -134.21 | 2.836 | -38.978 |
| 3.449468733641505 | -0.953 | -11.339 | -134.925 | 2.816 | -39.115 |
| 3.455751918948685 | -0.951 | -11.358 | -135.636 | 2.796 | -39.249 |
| 3.462035104255865 | -0.949 | -11.376 | -136.344 | 2.775 | -39.383 |
| 3.468318289563044 | -0.947 | -11.393 | -137.047 | 2.754 | -39.514 |
| 3.474601474870224 | -0.945 | -11.41 | -137.747 | 2.732 | -39.644 |
| 3.480884660177403 | -0.943 | -11.426 | -138.441 | 2.71 | -39.772 |
| 3.487167845484583 | -0.941 | -11.441 | -139.132 | 2.687 | -39.898 |
| 3.493451030791763 | -0.939 | -11.456 | -139.817 | 2.664 | -40.023 |
| 3.499734216098942 | -0.937 | -11.471 | -140.498 | 2.64 | -40.145 |
| 3.506017401406122 | -0.934 | -11.485 | -141.174 | 2.615 | -40.266 |
| 3.512300586713302 | -0.932 | -11.498 | -141.846 | 2.59 | -40.385 |
| 3.518583772020481 | -0.93 | -11.511 | -142.512 | 2.565 | -40.503 |
| 3.524866957327661 | -0.927 | -11.523 | -143.172 | 2.539 | -40.618 |
| 3.531150142634841 | -0.925 | -11.535 | -143.828 | 2.513 | -40.731 |
| 3.53743332794202 | -0.923 | -11.546 | -144.478 | 2.486 | -40.843 |
| 3.5437165132492 | -0.92 | -11.556 | -145.122 | 2.458 | -40.952 |
| 3.54999969855638 | -0.918 | -11.566 | -145.76 | 2.43 | -41.059 |
| 3.556282883863559 | -0.915 | -11.575 | -146.393 | 2.402 | -41.165 |
| 3.562566069170739 | -0.913 | -11.584 | -147.02 | 2.373 | -41.268 |
| 3.568849254477918 | -0.91 | -11.592 | -147.64 | 2.343 | -41.369 |
| 3.575132439785098 | -0.907 | -11.599 | -148.254 | 2.313 | -41.468 |
| 3.581415625092278 | -0.905 | -11.606 | -148.862 | 2.283 | -41.565 |
| 3.587698810399457 | -0.902 | -11.612 | -149.463 | 2.252 | -41.66 |
| 3.593981995706637 | -0.899 | -11.617 | -150.058 | 2.221 | -41.753 |
| 3.600265181013817 | -0.897 | -11.622 | -150.646 | 2.189 | -41.843 |
| 3.606548366320996 | -0.894 | -11.626 | -151.226 | 2.156 | -41.931 |
| 3.612831551628176 | -0.891 | -11.63 | -151.8 | 2.124 | -42.017 |
| 3.619114736935355 | -0.888 | -11.633 | -152.366 | 2.09 | -42.1 |
| 3.625397922242535 | -0.885 | -11.635 | -152.925 | 2.057 | -42.182 |
| 3.631681107549715 | -0.882 | -11.637 | -153.477 | 2.022 | -42.261 |
| 3.637964292856894 | -0.879 | -11.638 | -154.021 | 1.988 | -42.337 |
| 3.644247478164074 | -0.876 | -11.638 | -154.557 | 1.953 | -42.411 |
| 3.650530663471254 | -0.873 | -11.637 | -155.085 | 1.917 | -42.483 |
| 3.656813848778433 | -0.87 | -11.636 | -155.605 | 1.881 | -42.552 |
| 3.663097034085613 | -0.867 | -11.635 | -156.116 | 1.845 | -42.619 |
| 3.669380219392792 | -0.864 | -11.632 | -156.62 | 1.808 | -42.683 |
| 3.675663404699972 | -0.861 | -11.629 | -157.114 | 1.771 | -42.744 |
| 3.681946590007152 | -0.858 | -11.625 | -157.6 | 1.733 | -42.804 |
| 3.688229775314331 | -0.854 | -11.621 | -158.078 | 1.695 | -42.86 |
| 3.694512960621511 | -0.851 | -11.616 | -158.546 | 1.657 | -42.914 |
| 3.700796145928691 | -0.848 | -11.61 | -159.005 | 1.618 | -42.965 |
| 3.70707933123587 | -0.844 | -11.603 | -159.455 | 1.578 | -43.014 |
| 3.71336251654305 | -0.841 | -11.596 | -159.896 | 1.539 | -43.06 |
| 3.71964570185023 | -0.838 | -11.588 | -160.327 | 1.499 | -43.103 |
| 3.72592888715741 | -0.834 | -11.579 | -160.748 | 1.458 | -43.143 |
| 3.732212072464589 | -0.831 | -11.57 | -161.159 | 1.417 | -43.181 |
| 3.738495257771769 | -0.827 | -11.56 | -161.56 | 1.376 | -43.215 |
| 3.744778443078948 | -0.824 | -11.549 | -161.952 | 1.335 | -43.247 |
| 3.751061628386128 | -0.82 | -11.537 | -162.332 | 1.293 | -43.276 |
| 3.757344813693308 | -0.816 | -11.525 | -162.703 | 1.251 | -43.303 |
| 3.763627999000487 | -0.813 | -11.512 | -163.062 | 1.208 | -43.326 |
| 3.769911184307667 | -0.809 | -11.498 | -163.411 | 1.165 | -43.346 |
| 3.776194369614846 | -0.805 | -11.483 | -163.749 | 1.122 | -43.364 |
| 3.782477554922026 | -0.802 | -11.468 | -164.076 | 1.078 | -43.378 |
| 3.788760740229206 | -0.798 | -11.452 | -164.392 | 1.034 | -43.389 |
| 3.795043925536385 | -0.794 | -11.435 | -164.696 | 0.99 | -43.398 |
| 3.801327110843565 | -0.79 | -11.418 | -164.988 | 0.945 | -43.403 |
| 3.807610296150745 | -0.786 | -11.4 | -165.269 | 0.9 | -43.405 |
| 3.813893481457924 | -0.782 | -11.38 | -165.538 | 0.855 | -43.404 |
| 3.820176666765104 | -0.778 | -11.361 | -165.795 | 0.81 | -43.4 |
| 3.826459852072284 | -0.775 | -11.34 | -166.04 | 0.764 | -43.392 |
| 3.832743037379463 | -0.771 | -11.319 | -166.272 | 0.718 | -43.382 |
| 3.839026222686643 | -0.766 | -11.297 | -166.492 | 0.672 | -43.368 |
| 3.845309407993823 | -0.762 | -11.274 | -166.699 | 0.625 | -43.351 |
| 3.851592593301002 | -0.758 | -11.25 | -166.893 | 0.579 | -43.331 |
| 3.857875778608182 | -0.754 | -11.226 | -167.074 | 0.532 | -43.307 |
| 3.864158963915361 | -0.75 | -11.2 | -167.242 | 0.484 | -43.28 |
| 3.870442149222541 | -0.746 | -11.174 | -167.397 | 0.437 | -43.25 |
| 3.876725334529721 | -0.742 | -11.148 | -167.538 | 0.389 | -43.216 |
| 3.8830085198369 | -0.738 | -11.12 | -167.665 | 0.341 | -43.179 |
| 3.88929170514408 | -0.733 | -11.092 | -167.779 | 0.293 | -43.139 |
| 3.89557489045126 | -0.729 | -11.062 | -167.878 | 0.245 | -43.095 |
| 3.901858075758439 | -0.725 | -11.032 | -167.964 | 0.196 | -43.047 |
| 3.908141261065619 | -0.72 | -11.002 | -168.035 | 0.147 | -42.996 |
| 3.914424446372799 | -0.716 | -10.97 | -168.092 | 0.098 | -42.942 |
| 3.920707631679978 | -0.712 | -10.938 | -168.134 | 0.049 | -42.883 |
| 3.926990816987158 | -0.707 | -10.904 | -168.161 | 0 | -42.822 |
| 3.933274002294337 | -0.703 | -10.87 | -168.173 | -0.049 | -42.756 |
| 3.939557187601517 | -0.698 | -10.836 | -168.17 | -0.099 | -42.687 |
| 3.945840372908697 | -0.694 | -10.8 | -168.151 | -0.149 | -42.615 |
| 3.952123558215876 | -0.689 | -10.763 | -168.118 | -0.199 | -42.539 |
| 3.958406743523056 | -0.685 | -10.726 | -168.068 | -0.249 | -42.458 |
| 3.964689928830236 | -0.68 | -10.688 | -168.003 | -0.299 | -42.375 |
| 3.970973114137415 | -0.675 | -10.649 | -167.921 | -0.349 | -42.287 |
| 3.977256299444595 | -0.671 | -10.609 | -167.824 | -0.399 | -42.196 |
| 3.983539484751775 | -0.666 | -10.569 | -167.71 | -0.45 | -42.101 |
| 3.989822670058954 | -0.661 | -10.527 | -167.579 | -0.5 | -42.002 |
| 3.996105855366134 | -0.657 | -10.485 | -167.432 | -0.551 | -41.899 |
| 4.002389040673314 | -0.652 | -10.442 | -167.268 | -0.601 | -41.792 |
| 4.008672225980493 | -0.647 | -10.398 | -167.088 | -0.652 | -41.682 |
| 4.014955411287672 | -0.642 | -10.353 | -166.889 | -0.703 | -41.567 |
| 4.021238596594851 | -0.637 | -10.307 | -166.674 | -0.754 | -41.448 |
| 4.02752178190203 | -0.633 | -10.261 | -166.441 | -0.804 | -41.326 |
| 4.03380496720921 | -0.628 | -10.214 | -166.19 | -0.855 | -41.199 |
| 4.040088152516389 | -0.623 | -10.165 | -165.922 | -0.906 | -41.069 |
| 4.046371337823567 | -0.618 | -10.116 | -165.635 | -0.957 | -40.934 |
| 4.052654523130747 | -0.613 | -10.066 | -165.33 | -1.008 | -40.796 |
| 4.058937708437926 | -0.608 | -10.016 | -165.007 | -1.059 | -40.653 |
| 4.065220893745105 | -0.603 | -9.964 | -164.666 | -1.11 | -40.506 |
| 4.071504079052285 | -0.598 | -9.912 | -164.305 | -1.16 | -40.355 |
| 4.077787264359464 | -0.593 | -9.858 | -163.926 | -1.211 | -40.2 |
| 4.084070449666643 | -0.588 | -9.804 | -163.528 | -1.262 | -40.04 |
| 4.090353634973822 | -0.583 | -9.749 | -163.11 | -1.313 | -39.877 |
| 4.096636820281001 | -0.578 | -9.693 | -162.673 | -1.363 | -39.709 |
| 4.102920005588181 | -0.572 | -9.636 | -162.217 | -1.414 | -39.537 |
| 4.10920319089536 | -0.567 | -9.579 | -161.741 | -1.465 | -39.361 |
| 4.115486376202539 | -0.562 | -9.52 | -161.245 | -1.515 | -39.18 |
| 4.121769561509718 | -0.557 | -9.461 | -160.729 | -1.565 | -38.995 |
| 4.128052746816897 | -0.552 | -9.4 | -160.192 | -1.616 | -38.806 |
| 4.134335932124077 | -0.546 | -9.339 | -159.635 | -1.666 | -38.612 |
| 4.140619117431256 | -0.541 | -9.277 | -159.058 | -1.716 | -38.414 |
| 4.146902302738435 | -0.536 | -9.215 | -158.46 | -1.766 | -38.212 |
| 4.153185488045614 | -0.531 | -9.151 | -157.841 | -1.815 | -38.005 |
| 4.159468673352793 | -0.525 | -9.086 | -157.201 | -1.865 | -37.794 |
| 4.165751858659973 | -0.52 | -9.021 | -156.54 | -1.914 | -37.578 |
| 4.172035043967152 | -0.514 | -8.954 | -155.857 | -1.964 | -37.358 |
| 4.178318229274331 | -0.509 | -8.887 | -155.153 | -2.013 | -37.133 |
| 4.18460141458151 | -0.504 | -8.819 | -154.427 | -2.062 | -36.904 |
| 4.190884599888689 | -0.498 | -8.75 | -153.679 | -2.111 | -36.67 |
| 4.197167785195868 | -0.493 | -8.68 | -152.909 | -2.159 | -36.431 |
| 4.203450970503048 | -0.487 | -8.609 | -152.116 | -2.208 | -36.188 |
| 4.209734155810227 | -0.482 | -8.538 | -151.302 | -2.256 | -35.941 |
| 4.216017341117406 | -0.476 | -8.465 | -150.464 | -2.304 | -35.689 |
| 4.222300526424585 | -0.471 | -8.392 | -149.604 | -2.351 | -35.432 |
| 4.228583711731764 | -0.465 | -8.317 | -148.722 | -2.399 | -35.171 |
| 4.234866897038944 | -0.46 | -8.242 | -147.816 | -2.446 | -34.904 |
| 4.241150082346122 | -0.454 | -8.166 | -146.886 | -2.493 | -34.634 |
| 4.247433267653302 | -0.448 | -8.089 | -145.934 | -2.54 | -34.358 |
| 4.253716452960481 | -0.443 | -8.011 | -144.958 | -2.586 | -34.078 |
| 4.25999963826766 | -0.437 | -7.933 | -143.958 | -2.632 | -33.793 |
| 4.26628282357484 | -0.431 | -7.853 | -142.934 | -2.678 | -33.503 |
| 4.272566008882019 | -0.426 | -7.773 | -141.886 | -2.723 | -33.209 |
| 4.278849194189198 | -0.42 | -7.691 | -140.814 | -2.769 | -32.909 |
| 4.285132379496377 | -0.414 | -7.609 | -139.718 | -2.814 | -32.605 |
| 4.291415564803557 | -0.409 | -7.526 | -138.597 | -2.858 | -32.296 |
| 4.297698750110735 | -0.403 | -7.442 | -137.451 | -2.902 | -31.982 |
| 4.303981935417915 | -0.397 | -7.357 | -136.281 | -2.946 | -31.664 |
| 4.310265120725094 | -0.391 | -7.271 | -135.085 | -2.99 | -31.34 |
| 4.316548306032273 | -0.386 | -7.184 | -133.864 | -3.033 | -31.012 |
| 4.322831491339452 | -0.38 | -7.097 | -132.619 | -3.076 | -30.679 |
| 4.329114676646632 | -0.374 | -7.008 | -131.347 | -3.118 | -30.34 |
| 4.335397861953811 | -0.368 | -6.919 | -130.05 | -3.16 | -29.997 |
| 4.34168104726099 | -0.362 | -6.829 | -128.727 | -3.202 | -29.649 |
| 4.347964232568169 | -0.356 | -6.738 | -127.378 | -3.243 | -29.296 |
| 4.354247417875348 | -0.351 | -6.646 | -126.004 | -3.284 | -28.938 |
| 4.360530603182528 | -0.345 | -6.553 | -124.602 | -3.325 | -28.575 |
| 4.366813788489707 | -0.339 | -6.459 | -123.175 | -3.365 | -28.207 |
| 4.373096973796886 | -0.333 | -6.365 | -121.721 | -3.404 | -27.834 |
| 4.379380159104065 | -0.327 | -6.269 | -120.24 | -3.443 | -27.456 |
| 4.385663344411244 | -0.321 | -6.173 | -118.733 | -3.482 | -27.073 |
| 4.391946529718424 | -0.315 | -6.076 | -117.198 | -3.52 | -26.685 |
| 4.398229715025602 | -0.309 | -5.978 | -115.636 | -3.558 | -26.292 |
| 4.404512900332782 | -0.303 | -5.879 | -114.047 | -3.596 | -25.893 |
| 4.41079608563996 | -0.297 | -5.779 | -112.431 | -3.632 | -25.49 |
| 4.41707927094714 | -0.291 | -5.678 | -110.787 | -3.669 | -25.081 |
| 4.42336245625432 | -0.285 | -5.577 | -109.115 | -3.705 | -24.668 |
| 4.429645641561499 | -0.279 | -5.474 | -107.415 | -3.74 | -24.249 |
| 4.435928826868678 | -0.273 | -5.371 | -105.688 | -3.775 | -23.825 |
| 4.442212012175857 | -0.267 | -5.267 | -103.932 | -3.809 | -23.396 |
| 4.448495197483036 | -0.261 | -5.162 | -102.148 | -3.843 | -22.962 |
| 4.454778382790215 | -0.255 | -5.056 | -100.335 | -3.876 | -22.523 |
| 4.461061568097395 | -0.249 | -4.949 | -98.494 | -3.909 | -22.079 |
| 4.467344753404574 | -0.243 | -4.842 | -96.625 | -3.941 | -21.629 |
| 4.473627938711753 | -0.236 | -4.733 | -94.726 | -3.973 | -21.174 |
| 4.479911124018932 | -0.23 | -4.624 | -92.798 | -4.004 | -20.714 |
| 4.486194309326112 | -0.224 | -4.514 | -90.842 | -4.035 | -20.249 |
| 4.49247749463329 | -0.218 | -4.403 | -88.856 | -4.065 | -19.779 |
| 4.49876067994047 | -0.212 | -4.291 | -86.84 | -4.094 | -19.303 |
| 4.50504386524765 | -0.206 | -4.178 | -84.796 | -4.123 | -18.822 |
| 4.511327050554828 | -0.2 | -4.065 | -82.721 | -4.151 | -18.336 |
| 4.517610235862008 | -0.194 | -3.95 | -80.617 | -4.179 | -17.845 |
| 4.523893421169186 | -0.187 | -3.835 | -78.483 | -4.206 | -17.349 |
| 4.530176606476366 | -0.181 | -3.719 | -76.319 | -4.233 | -16.847 |
| 4.536459791783545 | -0.175 | -3.602 | -74.125 | -4.259 | -16.34 |
| 4.542742977090724 | -0.169 | -3.484 | -71.9 | -4.284 | -15.828 |
| 4.549026162397904 | -0.163 | -3.366 | -69.646 | -4.308 | -15.31 |
| 4.555309347705083 | -0.156 | -3.246 | -67.36 | -4.332 | -14.787 |
| 4.561592533012262 | -0.15 | -3.126 | -65.044 | -4.356 | -14.259 |
| 4.567875718319441 | -0.144 | -3.005 | -62.698 | -4.378 | -13.726 |
| 4.57415890362662 | -0.138 | -2.883 | -60.32 | -4.4 | -13.187 |
| 4.5804420889338 | -0.132 | -2.76 | -57.912 | -4.422 | -12.643 |
| 4.586725274240979 | -0.125 | -2.637 | -55.472 | -4.443 | -12.094 |
| 4.593008459548158 | -0.119 | -2.512 | -53.002 | -4.463 | -11.54 |
| 4.599291644855337 | -0.113 | -2.387 | -50.5 | -4.482 | -10.98 |
| 4.605574830162516 | -0.107 | -2.261 | -47.966 | -4.501 | -10.415 |
| 4.611858015469695 | -0.1 | -2.135 | -45.402 | -4.519 | -9.845 |
| 4.618141200776875 | -0.094 | -2.007 | -42.805 | -4.536 | -9.269 |
| 4.624424386084054 | -0.088 | -1.879 | -40.177 | -4.553 | -8.688 |
| 4.630707571391233 | -0.082 | -1.75 | -37.517 | -4.569 | -8.102 |
| 4.636990756698412 | -0.075 | -1.62 | -34.825 | -4.584 | -7.51 |
| 4.643273942005591 | -0.069 | -1.489 | -32.101 | -4.599 | -6.914 |
| 4.649557127312771 | -0.063 | -1.357 | -29.345 | -4.613 | -6.311 |
| 4.65584031261995 | -0.057 | -1.225 | -26.557 | -4.626 | -5.704 |
| 4.66212349792713 | -0.05 | -1.092 | -23.737 | -4.639 | -5.091 |
| 4.668406683234308 | -0.044 | -0.958 | -20.884 | -4.65 | -4.473 |
| 4.674689868541487 | -0.038 | -0.824 | -17.999 | -4.661 | -3.85 |
| 4.680973053848666 | -0.031 | -0.688 | -15.081 | -4.672 | -3.222 |
| 4.687256239155846 | -0.025 | -0.552 | -12.13 | -4.681 | -2.588 |
| 4.693539424463024 | -0.019 | -0.415 | -9.147 | -4.69 | -1.949 |
| 4.699822609770204 | -0.013 | -0.278 | -6.131 | -4.698 | -1.304 |
| 4.706105795077383 | -0.006 | -0.139 | -3.082 | -4.706 | -0.655 |
| 4.712388980384562 | 0 | 0 | 0 | -4.712 | 0 |
| 4.718672165691741 | 0.006 | 0.14 | 3.115 | -4.718 | 0.66 |
| 4.724955350998921 | 0.013 | 0.281 | 6.263 | -4.723 | 1.326 |
| 4.7312385363061 | 0.019 | 0.422 | 9.444 | -4.728 | 1.996 |
| 4.73752172161328 | 0.025 | 0.564 | 12.659 | -4.732 | 2.672 |
| 4.743804906920459 | 0.031 | 0.707 | 15.907 | -4.734 | 3.353 |
| 4.750088092227637 | 0.038 | 0.85 | 19.188 | -4.737 | 4.04 |
| 4.756371277534817 | 0.044 | 0.995 | 22.503 | -4.738 | 4.731 |
| 4.762654462841996 | 0.05 | 1.14 | 25.851 | -4.739 | 5.428 |
| 4.768937648149175 | 0.057 | 1.285 | 29.233 | -4.738 | 6.13 |
| 4.775220833456354 | 0.063 | 1.432 | 32.649 | -4.738 | 6.837 |
| 4.781504018763534 | 0.069 | 1.579 | 36.098 | -4.736 | 7.55 |
| 4.787787204070713 | 0.075 | 1.727 | 39.581 | -4.733 | 8.267 |
| 4.794070389377892 | 0.082 | 1.875 | 43.098 | -4.73 | 8.99 |
| 4.800353574685071 | 0.088 | 2.024 | 46.649 | -4.726 | 9.718 |
| 4.806636759992251 | 0.094 | 2.174 | 50.233 | -4.721 | 10.451 |
| 4.81291994529943 | 0.1 | 2.325 | 53.852 | -4.716 | 11.189 |
| 4.819203130606608 | 0.107 | 2.476 | 57.505 | -4.71 | 11.932 |
| 4.825486315913788 | 0.113 | 2.628 | 61.191 | -4.703 | 12.681 |
| 4.831769501220967 | 0.119 | 2.78 | 64.912 | -4.695 | 13.434 |
| 4.838052686528146 | 0.125 | 2.934 | 68.667 | -4.686 | 14.193 |
| 4.844335871835326 | 0.132 | 3.087 | 72.456 | -4.677 | 14.957 |
| 4.850619057142505 | 0.138 | 3.242 | 76.279 | -4.666 | 15.726 |
| 4.856902242449684 | 0.144 | 3.397 | 80.137 | -4.655 | 16.5 |
| 4.863185427756863 | 0.15 | 3.553 | 84.029 | -4.644 | 17.279 |
| 4.869468613064042 | 0.156 | 3.709 | 87.955 | -4.631 | 18.062 |
| 4.875751798371221 | 0.163 | 3.866 | 91.915 | -4.618 | 18.851 |
| 4.882034983678401 | 0.169 | 4.024 | 95.91 | -4.604 | 19.645 |
| 4.88831816898558 | 0.175 | 4.182 | 99.939 | -4.589 | 20.444 |
| 4.894601354292759 | 0.181 | 4.341 | 104.002 | -4.573 | 21.248 |
| 4.900884539599939 | 0.187 | 4.501 | 108.1 | -4.557 | 22.057 |
| 4.907167724907117 | 0.194 | 4.661 | 112.232 | -4.54 | 22.871 |
| 4.913450910214297 | 0.2 | 4.821 | 116.398 | -4.522 | 23.69 |
| 4.919734095521476 | 0.206 | 4.983 | 120.599 | -4.503 | 24.513 |
| 4.926017280828655 | 0.212 | 5.144 | 124.834 | -4.483 | 25.342 |
| 4.932300466135834 | 0.218 | 5.307 | 129.104 | -4.463 | 26.175 |
| 4.938583651443014 | 0.224 | 5.47 | 133.408 | -4.442 | 27.013 |
| 4.944866836750193 | 0.23 | 5.633 | 137.747 | -4.42 | 27.856 |
| 4.951150022057372 | 0.236 | 5.798 | 142.119 | -4.397 | 28.704 |
| 4.957433207364551 | 0.243 | 5.962 | 146.527 | -4.374 | 29.557 |
| 4.96371639267173 | 0.249 | 6.127 | 150.968 | -4.35 | 30.414 |
| 4.96999957797891 | 0.255 | 6.293 | 155.444 | -4.325 | 31.277 |
| 4.976282763286088 | 0.261 | 6.459 | 159.955 | -4.299 | 32.143 |
| 4.982565948593268 | 0.267 | 6.626 | 164.499 | -4.273 | 33.015 |
| 4.988849133900447 | 0.273 | 6.793 | 169.078 | -4.245 | 33.891 |
| 4.995132319207626 | 0.279 | 6.961 | 173.691 | -4.218 | 34.772 |
| 5.001415504514805 | 0.285 | 7.13 | 178.339 | -4.189 | 35.658 |
| 5.007698689821984 | 0.291 | 7.298 | 183.02 | -4.159 | 36.548 |
| 5.013981875129164 | 0.297 | 7.468 | 187.736 | -4.129 | 37.443 |
| 5.020265060436343 | 0.303 | 7.637 | 192.486 | -4.098 | 38.342 |
| 5.026548245743522 | 0.309 | 7.808 | 197.27 | -4.067 | 39.246 |
| 5.032831431050702 | 0.315 | 7.978 | 202.088 | -4.034 | 40.154 |
| 5.039114616357881 | 0.321 | 8.15 | 206.941 | -4.001 | 41.067 |
| 5.04539780166506 | 0.327 | 8.321 | 211.827 | -3.967 | 41.984 |
| 5.05168098697224 | 0.333 | 8.493 | 216.747 | -3.933 | 42.906 |
| 5.057964172279418 | 0.339 | 8.666 | 221.701 | -3.897 | 43.832 |
| 5.064247357586598 | 0.345 | 8.839 | 226.688 | -3.861 | 44.762 |
| 5.070530542893777 | 0.351 | 9.012 | 231.71 | -3.824 | 45.697 |
| 5.076813728200956 | 0.356 | 9.186 | 236.765 | -3.787 | 46.636 |
| 5.083096913508135 | 0.362 | 9.36 | 241.853 | -3.749 | 47.58 |
| 5.089380098815314 | 0.368 | 9.535 | 246.976 | -3.71 | 48.528 |
| 5.095663284122493 | 0.374 | 9.71 | 252.132 | -3.67 | 49.48 |
| 5.101946469429673 | 0.38 | 9.886 | 257.321 | -3.63 | 50.436 |
| 5.108229654736852 | 0.386 | 10.061 | 262.543 | -3.589 | 51.396 |
| 5.114512840044031 | 0.391 | 10.238 | 267.799 | -3.548 | 52.361 |
| 5.12079602535121 | 0.397 | 10.414 | 273.088 | -3.505 | 53.329 |
| 5.12707921065839 | 0.403 | 10.591 | 278.41 | -3.462 | 54.302 |
| 5.133362395965568 | 0.409 | 10.768 | 283.765 | -3.419 | 55.279 |
| 5.139645581272747 | 0.414 | 10.946 | 289.152 | -3.375 | 56.259 |
| 5.145928766579927 | 0.42 | 11.124 | 294.573 | -3.33 | 57.244 |
| 5.152211951887106 | 0.426 | 11.302 | 300.026 | -3.284 | 58.233 |
| 5.158495137194286 | 0.431 | 11.481 | 305.512 | -3.238 | 59.225 |
| 5.164778322501465 | 0.437 | 11.66 | 311.031 | -3.191 | 60.221 |
| 5.171061507808644 | 0.443 | 11.839 | 316.581 | -3.144 | 61.222 |
| 5.177344693115823 | 0.448 | 12.019 | 322.164 | -3.096 | 62.226 |
| 5.183627878423002 | 0.454 | 12.199 | 327.78 | -3.047 | 63.234 |
| 5.189911063730181 | 0.46 | 12.379 | 333.427 | -2.998 | 64.245 |
| 5.196194249037361 | 0.465 | 12.559 | 339.106 | -2.948 | 65.26 |
| 5.20247743434454 | 0.471 | 12.74 | 344.817 | -2.897 | 66.279 |
| 5.20876061965172 | 0.476 | 12.921 | 350.56 | -2.846 | 67.302 |
| 5.215043804958898 | 0.482 | 13.102 | 356.334 | -2.794 | 68.328 |
| 5.221326990266077 | 0.487 | 13.284 | 362.139 | -2.742 | 69.358 |
| 5.227610175573257 | 0.493 | 13.465 | 367.976 | -2.689 | 70.391 |
| 5.233893360880435 | 0.498 | 13.647 | 373.844 | -2.636 | 71.427 |
| 5.240176546187615 | 0.504 | 13.829 | 379.743 | -2.582 | 72.468 |
| 5.246459731494794 | 0.509 | 14.012 | 385.672 | -2.528 | 73.511 |
| 5.252742916801973 | 0.514 | 14.194 | 391.633 | -2.472 | 74.558 |
| 5.259026102109152 | 0.52 | 14.377 | 397.624 | -2.417 | 75.608 |
| 5.265309287416332 | 0.525 | 14.56 | 403.645 | -2.361 | 76.661 |
| 5.27159247272351 | 0.531 | 14.743 | 409.696 | -2.304 | 77.718 |
| 5.27787565803069 | 0.536 | 14.926 | 415.778 | -2.247 | 78.777 |
| 5.284158843337869 | 0.541 | 15.109 | 421.889 | -2.19 | 79.84 |
| 5.290442028645049 | 0.546 | 15.293 | 428.03 | -2.132 | 80.906 |
| 5.296725213952227 | 0.552 | 15.477 | 434.2 | -2.073 | 81.975 |
| 5.303008399259407 | 0.557 | 15.66 | 440.4 | -2.014 | 83.047 |
| 5.309291584566586 | 0.562 | 15.844 | 446.629 | -1.954 | 84.122 |
| 5.315574769873765 | 0.567 | 16.028 | 452.887 | -1.895 | 85.2 |
| 5.321857955180945 | 0.572 | 16.213 | 459.174 | -1.834 | 86.281 |
| 5.328141140488124 | 0.578 | 16.397 | 465.489 | -1.773 | 87.364 |
| 5.334424325795303 | 0.583 | 16.581 | 471.833 | -1.712 | 88.451 |
| 5.340707511102482 | 0.588 | 16.765 | 478.205 | -1.65 | 89.54 |
| 5.346990696409661 | 0.593 | 16.95 | 484.605 | -1.588 | 90.631 |
| 5.35327388171684 | 0.598 | 17.134 | 491.032 | -1.526 | 91.726 |
| 5.35955706702402 | 0.603 | 17.319 | 497.487 | -1.463 | 92.823 |
| 5.365840252331199 | 0.608 | 17.504 | 503.97 | -1.4 | 93.922 |
| 5.372123437638378 | 0.613 | 17.688 | 510.48 | -1.336 | 95.024 |
| 5.378406622945557 | 0.618 | 17.873 | 517.016 | -1.272 | 96.128 |
| 5.384689808252737 | 0.623 | 18.058 | 523.58 | -1.208 | 97.235 |
| 5.390972993559916 | 0.628 | 18.242 | 530.17 | -1.143 | 98.344 |
| 5.397256178867095 | 0.633 | 18.427 | 536.786 | -1.078 | 99.455 |
| 5.403539364174274 | 0.637 | 18.612 | 543.428 | -1.013 | 100.569 |
| 5.409822549481453 | 0.642 | 18.796 | 550.095 | -0.947 | 101.685 |
| 5.416105734788632 | 0.647 | 18.981 | 556.789 | -0.881 | 102.802 |
| 5.422388920095812 | 0.652 | 19.165 | 563.507 | -0.815 | 103.922 |
| 5.42867210540299 | 0.657 | 19.35 | 570.251 | -0.748 | 105.044 |
| 5.43495529071017 | 0.661 | 19.534 | 577.019 | -0.681 | 106.168 |
| 5.44123847601735 | 0.666 | 19.719 | 583.812 | -0.614 | 107.294 |
| 5.447521661324528 | 0.671 | 19.903 | 590.629 | -0.547 | 108.422 |
| 5.453804846631708 | 0.675 | 20.087 | 597.47 | -0.479 | 109.551 |
| 5.460088031938887 | 0.68 | 20.271 | 604.335 | -0.411 | 110.682 |
| 5.466371217246066 | 0.685 | 20.455 | 611.223 | -0.343 | 111.815 |
| 5.472654402553245 | 0.689 | 20.639 | 618.135 | -0.275 | 112.95 |
| 5.478937587860424 | 0.694 | 20.823 | 625.069 | -0.207 | 114.086 |
| 5.485220773167603 | 0.698 | 21.006 | 632.026 | -0.138 | 115.223 |
| 5.491503958474783 | 0.703 | 21.19 | 639.005 | -0.069 | 116.362 |
| 5.497787143781962 | 0.707 | 21.373 | 646.006 | 0 | 117.503 |
| 5.504070329089141 | 0.712 | 21.556 | 653.029 | 0.069 | 118.645 |
| 5.51035351439632 | 0.716 | 21.739 | 660.074 | 0.138 | 119.788 |
| 5.5166366997035 | 0.72 | 21.921 | 667.139 | 0.208 | 120.932 |
| 5.522919885010679 | 0.725 | 22.104 | 674.225 | 0.277 | 122.078 |
| 5.529203070317858 | 0.729 | 22.286 | 681.332 | 0.347 | 123.224 |
| 5.535486255625037 | 0.733 | 22.468 | 688.459 | 0.417 | 124.372 |
| 5.541769440932216 | 0.738 | 22.65 | 695.606 | 0.487 | 125.521 |
| 5.548052626239396 | 0.742 | 22.831 | 702.773 | 0.557 | 126.67 |
| 5.554335811546575 | 0.746 | 23.013 | 709.959 | 0.627 | 127.821 |
| 5.560618996853754 | 0.75 | 23.194 | 717.163 | 0.697 | 128.972 |
| 5.566902182160933 | 0.754 | 23.375 | 724.387 | 0.767 | 130.124 |
| 5.573185367468112 | 0.758 | 23.555 | 731.628 | 0.837 | 131.276 |
| 5.579468552775292 | 0.762 | 23.735 | 738.888 | 0.907 | 132.43 |
| 5.585751738082471 | 0.766 | 23.915 | 746.165 | 0.978 | 133.584 |
| 5.59203492338965 | 0.771 | 24.095 | 753.459 | 1.048 | 134.738 |
| 5.59831810869683 | 0.775 | 24.274 | 760.77 | 1.118 | 135.893 |
| 5.604601294004008 | 0.778 | 24.453 | 768.098 | 1.188 | 137.048 |
| 5.610884479311188 | 0.782 | 24.631 | 775.442 | 1.258 | 138.203 |
| 5.617167664618367 | 0.786 | 24.809 | 782.801 | 1.328 | 139.359 |
| 5.623450849925546 | 0.79 | 24.987 | 790.176 | 1.398 | 140.514 |
| 5.629734035232725 | 0.794 | 25.165 | 797.566 | 1.468 | 141.67 |
| 5.636017220539904 | 0.798 | 25.342 | 804.971 | 1.538 | 142.826 |
| 5.642300405847083 | 0.802 | 25.518 | 812.39 | 1.608 | 143.982 |
| 5.648583591154263 | 0.805 | 25.695 | 819.823 | 1.678 | 145.138 |
| 5.654866776461442 | 0.809 | 25.87 | 827.27 | 1.747 | 146.293 |
| 5.661149961768621 | 0.813 | 26.046 | 834.73 | 1.817 | 147.449 |
| 5.6674331470758 | 0.816 | 26.221 | 842.202 | 1.886 | 148.604 |
| 5.673716332382979 | 0.82 | 26.395 | 849.687 | 1.955 | 149.758 |
| 5.679999517690159 | 0.824 | 26.569 | 857.184 | 2.024 | 150.913 |
| 5.686282702997337 | 0.827 | 26.743 | 864.692 | 2.093 | 152.066 |
| 5.692565888304517 | 0.831 | 26.916 | 872.212 | 2.162 | 153.219 |
| 5.698849073611696 | 0.834 | 27.088 | 879.742 | 2.23 | 154.372 |
| 5.705132258918875 | 0.838 | 27.26 | 887.283 | 2.299 | 155.524 |
| 5.711415444226055 | 0.841 | 27.432 | 894.834 | 2.367 | 156.675 |
| 5.717698629533234 | 0.844 | 27.603 | 902.394 | 2.434 | 157.825 |
| 5.723981814840413 | 0.848 | 27.773 | 909.963 | 2.502 | 158.974 |
| 5.730265000147592 | 0.851 | 27.943 | 917.541 | 2.569 | 160.122 |
| 5.73654818545477 | 0.854 | 28.113 | 925.127 | 2.636 | 161.269 |
| 5.742831370761951 | 0.858 | 28.281 | 932.721 | 2.703 | 162.415 |
| 5.74911455606913 | 0.861 | 28.45 | 940.323 | 2.77 | 163.56 |
| 5.75539774137631 | 0.864 | 28.617 | 947.931 | 2.836 | 164.703 |
| 5.761680926683488 | 0.867 | 28.784 | 955.545 | 2.902 | 165.845 |
| 5.767964111990667 | 0.87 | 28.951 | 963.166 | 2.967 | 166.985 |
| 5.774247297297846 | 0.873 | 29.116 | 970.792 | 3.032 | 168.124 |
| 5.780530482605025 | 0.876 | 29.281 | 978.424 | 3.097 | 169.262 |
| 5.786813667912205 | 0.879 | 29.446 | 986.06 | 3.162 | 170.398 |
| 5.793096853219384 | 0.882 | 29.61 | 993.7 | 3.226 | 171.532 |
| 5.799380038526563 | 0.885 | 29.773 | 1001.343 | 3.29 | 172.664 |
| 5.805663223833742 | 0.888 | 29.935 | 1008.99 | 3.353 | 173.794 |
| 5.811946409140922 | 0.891 | 30.097 | 1016.64 | 3.416 | 174.923 |
| 5.8182295944481 | 0.894 | 30.258 | 1024.292 | 3.479 | 176.049 |
| 5.82451277975528 | 0.897 | 30.419 | 1031.946 | 3.541 | 177.173 |
| 5.830795965062459 | 0.899 | 30.578 | 1039.601 | 3.603 | 178.295 |
| 5.837079150369638 | 0.902 | 30.737 | 1047.257 | 3.664 | 179.415 |
| 5.843362335676817 | 0.905 | 30.895 | 1054.913 | 3.725 | 180.532 |
| 5.849645520983997 | 0.907 | 31.053 | 1062.57 | 3.785 | 181.647 |
| 5.855928706291176 | 0.91 | 31.209 | 1070.225 | 3.845 | 182.759 |
| 5.862211891598355 | 0.913 | 31.365 | 1077.879 | 3.904 | 183.869 |
| 5.868495076905535 | 0.915 | 31.52 | 1085.532 | 3.963 | 184.976 |
| 5.874778262212714 | 0.918 | 31.674 | 1093.182 | 4.022 | 186.081 |
| 5.881061447519893 | 0.92 | 31.828 | 1100.83 | 4.079 | 187.182 |
| 5.887344632827072 | 0.923 | 31.981 | 1108.474 | 4.137 | 188.281 |
| 5.893627818134251 | 0.925 | 32.132 | 1116.115 | 4.194 | 189.377 |
| 5.899911003441431 | 0.927 | 32.283 | 1123.751 | 4.25 | 190.469 |
| 5.90619418874861 | 0.93 | 32.434 | 1131.382 | 4.305 | 191.559 |
| 5.912477374055789 | 0.932 | 32.583 | 1139.009 | 4.361 | 192.645 |
| 5.918760559362968 | 0.934 | 32.731 | 1146.629 | 4.415 | 193.728 |
| 5.925043744670147 | 0.937 | 32.879 | 1154.243 | 4.469 | 194.807 |
| 5.931326929977326 | 0.939 | 33.025 | 1161.85 | 4.522 | 195.884 |
| 5.937610115284505 | 0.941 | 33.171 | 1169.449 | 4.575 | 196.956 |
| 5.943893300591684 | 0.943 | 33.316 | 1177.04 | 4.627 | 198.025 |
| 5.950176485898864 | 0.945 | 33.46 | 1184.623 | 4.679 | 199.09 |
| 5.956459671206043 | 0.947 | 33.602 | 1192.197 | 4.729 | 200.152 |
| 5.962742856513223 | 0.949 | 33.744 | 1199.76 | 4.78 | 201.209 |
| 5.969026041820402 | 0.951 | 33.885 | 1207.314 | 4.829 | 202.263 |
| 5.975309227127581 | 0.953 | 34.025 | 1214.857 | 4.878 | 203.313 |
| 5.98159241243476 | 0.955 | 34.165 | 1222.388 | 4.926 | 204.358 |
| 5.987875597741939 | 0.957 | 34.303 | 1229.907 | 4.974 | 205.4 |
| 5.994158783049118 | 0.959 | 34.44 | 1237.414 | 5.02 | 206.437 |
| 6.000441968356298 | 0.96 | 34.576 | 1244.907 | 5.066 | 207.469 |
| 6.006725153663476 | 0.962 | 34.711 | 1252.387 | 5.112 | 208.497 |
| 6.013008338970656 | 0.964 | 34.845 | 1259.853 | 5.156 | 209.521 |
| 6.019291524277835 | 0.965 | 34.978 | 1267.303 | 5.2 | 210.54 |
| 6.025574709585015 | 0.967 | 35.109 | 1274.738 | 5.243 | 211.555 |
| 6.031857894892193 | 0.969 | 35.24 | 1282.157 | 5.286 | 212.564 |
| 6.038141080199372 | 0.97 | 35.37 | 1289.56 | 5.327 | 213.569 |
| 6.044424265506552 | 0.972 | 35.499 | 1296.945 | 5.368 | 214.569 |
| 6.050707450813731 | 0.973 | 35.626 | 1304.312 | 5.408 | 215.564 |
| 6.05699063612091 | 0.975 | 35.753 | 1311.66 | 5.448 | 216.553 |
| 6.06327382142809 | 0.976 | 35.878 | 1318.99 | 5.486 | 217.538 |
| 6.069557006735269 | 0.977 | 36.002 | 1326.3 | 5.524 | 218.517 |
| 6.075840192042448 | 0.979 | 36.125 | 1333.589 | 5.561 | 219.491 |
| 6.082123377349627 | 0.98 | 36.247 | 1340.858 | 5.597 | 220.459 |
| 6.088406562656806 | 0.981 | 36.368 | 1348.105 | 5.632 | 221.422 |
| 6.094689747963986 | 0.982 | 36.487 | 1355.33 | 5.667 | 222.379 |
| 6.100972933271164 | 0.983 | 36.606 | 1362.532 | 5.7 | 223.33 |
| 6.107256118578344 | 0.985 | 36.723 | 1369.71 | 5.733 | 224.276 |
| 6.113539303885523 | 0.986 | 36.839 | 1376.864 | 5.765 | 225.216 |
| 6.119822489192702 | 0.987 | 36.954 | 1383.994 | 5.796 | 226.149 |
| 6.126105674499882 | 0.988 | 37.067 | 1391.098 | 5.826 | 227.077 |
| 6.132388859807061 | 0.989 | 37.179 | 1398.177 | 5.856 | 227.999 |
| 6.13867204511424 | 0.99 | 37.29 | 1405.228 | 5.884 | 228.914 |
| 6.144955230421419 | 0.99 | 37.4 | 1412.253 | 5.912 | 229.823 |
| 6.151238415728598 | 0.991 | 37.509 | 1419.249 | 5.938 | 230.726 |
| 6.157521601035778 | 0.992 | 37.616 | 1426.217 | 5.964 | 231.622 |
| 6.163804786342957 | 0.993 | 37.722 | 1433.156 | 5.989 | 232.512 |
| 6.170087971650136 | 0.994 | 37.827 | 1440.065 | 6.013 | 233.394 |
| 6.176371156957315 | 0.994 | 37.93 | 1446.943 | 6.036 | 234.271 |
| 6.182654342264494 | 0.995 | 38.032 | 1453.79 | 6.058 | 235.14 |
| 6.188937527571674 | 0.996 | 38.133 | 1460.605 | 6.079 | 236.002 |
| 6.195220712878853 | 0.996 | 38.232 | 1467.387 | 6.1 | 236.858 |
| 6.201503898186032 | 0.997 | 38.33 | 1474.136 | 6.119 | 237.706 |
| 6.207787083493211 | 0.997 | 38.427 | 1480.852 | 6.137 | 238.547 |
| 6.21407026880039 | 0.998 | 38.522 | 1487.533 | 6.155 | 239.381 |
| 6.22035345410757 | 0.998 | 38.616 | 1494.178 | 6.171 | 240.208 |
| 6.226636639414749 | 0.998 | 38.709 | 1500.788 | 6.187 | 241.027 |
| 6.232919824721928 | 0.999 | 38.8 | 1507.361 | 6.201 | 241.839 |
| 6.239203010029107 | 0.999 | 38.89 | 1513.897 | 6.215 | 242.643 |
| 6.245486195336286 | 0.999 | 38.978 | 1520.395 | 6.228 | 243.439 |
| 6.251769380643465 | 1 | 39.065 | 1526.854 | 6.239 | 244.227 |
| 6.258052565950644 | 1 | 39.151 | 1533.274 | 6.25 | 245.008 |
| 6.264335751257824 | 1 | 39.235 | 1539.653 | 6.26 | 245.781 |
| 6.270618936565003 | 1 | 39.318 | 1545.992 | 6.269 | 246.545 |
| 6.276902121872182 | 1 | 39.399 | 1552.29 | 6.276 | 247.302 |
| 6.283185307179361 | 1 | 39.478 | 1558.545 | 6.283 | 248.05 |